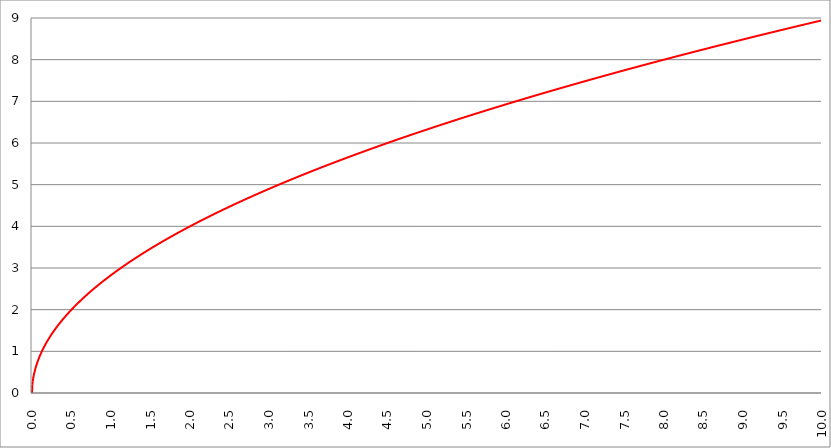
| Category | Series 1 | Series 0 | Series 2 |
|---|---|---|---|
| 0.0 | 0 |  |  |
| 0.005 | 0.2 |  |  |
| 0.01 | 0.283 |  |  |
| 0.015 | 0.346 |  |  |
| 0.02 | 0.4 |  |  |
| 0.025 | 0.447 |  |  |
| 0.03 | 0.49 |  |  |
| 0.035 | 0.529 |  |  |
| 0.04 | 0.566 |  |  |
| 0.045 | 0.6 |  |  |
| 0.05 | 0.632 |  |  |
| 0.055 | 0.663 |  |  |
| 0.06 | 0.693 |  |  |
| 0.065 | 0.721 |  |  |
| 0.07 | 0.748 |  |  |
| 0.075 | 0.775 |  |  |
| 0.08 | 0.8 |  |  |
| 0.085 | 0.825 |  |  |
| 0.09 | 0.849 |  |  |
| 0.095 | 0.872 |  |  |
| 0.1 | 0.894 |  |  |
| 0.105 | 0.917 |  |  |
| 0.11 | 0.938 |  |  |
| 0.115 | 0.959 |  |  |
| 0.12 | 0.98 |  |  |
| 0.125 | 1 |  |  |
| 0.13 | 1.02 |  |  |
| 0.135 | 1.039 |  |  |
| 0.14 | 1.058 |  |  |
| 0.145 | 1.077 |  |  |
| 0.15 | 1.095 |  |  |
| 0.155 | 1.114 |  |  |
| 0.16 | 1.131 |  |  |
| 0.165 | 1.149 |  |  |
| 0.17 | 1.166 |  |  |
| 0.175 | 1.183 |  |  |
| 0.18 | 1.2 |  |  |
| 0.185 | 1.217 |  |  |
| 0.19 | 1.233 |  |  |
| 0.195 | 1.249 |  |  |
| 0.2 | 1.265 |  |  |
| 0.205 | 1.281 |  |  |
| 0.21 | 1.296 |  |  |
| 0.215 | 1.311 |  |  |
| 0.22 | 1.327 |  |  |
| 0.225 | 1.342 |  |  |
| 0.23 | 1.356 |  |  |
| 0.235 | 1.371 |  |  |
| 0.24 | 1.386 |  |  |
| 0.245 | 1.4 |  |  |
| 0.25 | 1.414 |  |  |
| 0.255 | 1.428 |  |  |
| 0.26 | 1.442 |  |  |
| 0.265 | 1.456 |  |  |
| 0.27 | 1.47 |  |  |
| 0.275 | 1.483 |  |  |
| 0.28 | 1.497 |  |  |
| 0.285 | 1.51 |  |  |
| 0.29 | 1.523 |  |  |
| 0.295 | 1.536 |  |  |
| 0.3 | 1.549 |  |  |
| 0.305 | 1.562 |  |  |
| 0.31 | 1.575 |  |  |
| 0.315 | 1.587 |  |  |
| 0.32 | 1.6 |  |  |
| 0.325 | 1.612 |  |  |
| 0.33 | 1.625 |  |  |
| 0.335 | 1.637 |  |  |
| 0.34 | 1.649 |  |  |
| 0.345 | 1.661 |  |  |
| 0.35 | 1.673 |  |  |
| 0.355 | 1.685 |  |  |
| 0.36 | 1.697 |  |  |
| 0.365 | 1.709 |  |  |
| 0.37 | 1.72 |  |  |
| 0.375 | 1.732 |  |  |
| 0.38 | 1.744 |  |  |
| 0.385 | 1.755 |  |  |
| 0.39 | 1.766 |  |  |
| 0.395 | 1.778 |  |  |
| 0.4 | 1.789 |  |  |
| 0.405 | 1.8 |  |  |
| 0.41 | 1.811 |  |  |
| 0.415 | 1.822 |  |  |
| 0.42 | 1.833 |  |  |
| 0.425 | 1.844 |  |  |
| 0.43 | 1.855 |  |  |
| 0.435 | 1.865 |  |  |
| 0.44 | 1.876 |  |  |
| 0.445 | 1.887 |  |  |
| 0.45 | 1.897 |  |  |
| 0.455 | 1.908 |  |  |
| 0.46 | 1.918 |  |  |
| 0.465 | 1.929 |  |  |
| 0.47 | 1.939 |  |  |
| 0.475 | 1.949 |  |  |
| 0.48 | 1.96 |  |  |
| 0.485 | 1.97 |  |  |
| 0.49 | 1.98 |  |  |
| 0.495 | 1.99 |  |  |
| 0.5 | 2 |  |  |
| 0.505 | 2.01 |  |  |
| 0.51 | 2.02 |  |  |
| 0.515 | 2.03 |  |  |
| 0.52 | 2.04 |  |  |
| 0.525 | 2.049 |  |  |
| 0.53 | 2.059 |  |  |
| 0.535 | 2.069 |  |  |
| 0.54 | 2.078 |  |  |
| 0.545 | 2.088 |  |  |
| 0.55 | 2.098 |  |  |
| 0.555 | 2.107 |  |  |
| 0.56 | 2.117 |  |  |
| 0.565 | 2.126 |  |  |
| 0.57 | 2.135 |  |  |
| 0.575 | 2.145 |  |  |
| 0.58 | 2.154 |  |  |
| 0.585 | 2.163 |  |  |
| 0.59 | 2.173 |  |  |
| 0.595 | 2.182 |  |  |
| 0.6 | 2.191 |  |  |
| 0.605 | 2.2 |  |  |
| 0.61 | 2.209 |  |  |
| 0.615 | 2.218 |  |  |
| 0.62 | 2.227 |  |  |
| 0.625 | 2.236 |  |  |
| 0.63 | 2.245 |  |  |
| 0.635 | 2.254 |  |  |
| 0.64 | 2.263 |  |  |
| 0.645 | 2.272 |  |  |
| 0.65 | 2.28 |  |  |
| 0.655 | 2.289 |  |  |
| 0.66 | 2.298 |  |  |
| 0.665 | 2.307 |  |  |
| 0.67 | 2.315 |  |  |
| 0.675 | 2.324 |  |  |
| 0.68 | 2.332 |  |  |
| 0.685 | 2.341 |  |  |
| 0.69 | 2.349 |  |  |
| 0.695 | 2.358 |  |  |
| 0.7 | 2.366 |  |  |
| 0.705 | 2.375 |  |  |
| 0.71 | 2.383 |  |  |
| 0.715 | 2.392 |  |  |
| 0.72 | 2.4 |  |  |
| 0.725 | 2.408 |  |  |
| 0.73 | 2.417 |  |  |
| 0.735 | 2.425 |  |  |
| 0.74 | 2.433 |  |  |
| 0.745 | 2.441 |  |  |
| 0.75 | 2.449 |  |  |
| 0.755 | 2.458 |  |  |
| 0.76 | 2.466 |  |  |
| 0.765 | 2.474 |  |  |
| 0.77 | 2.482 |  |  |
| 0.775000000000001 | 2.49 |  |  |
| 0.78 | 2.498 |  |  |
| 0.785000000000001 | 2.506 |  |  |
| 0.79 | 2.514 |  |  |
| 0.795000000000001 | 2.522 |  |  |
| 0.800000000000001 | 2.53 |  |  |
| 0.805000000000001 | 2.538 |  |  |
| 0.810000000000001 | 2.546 |  |  |
| 0.815000000000001 | 2.553 |  |  |
| 0.820000000000001 | 2.561 |  |  |
| 0.825000000000001 | 2.569 |  |  |
| 0.830000000000001 | 2.577 |  |  |
| 0.835000000000001 | 2.585 |  |  |
| 0.840000000000001 | 2.592 |  |  |
| 0.845000000000001 | 2.6 |  |  |
| 0.850000000000001 | 2.608 |  |  |
| 0.855000000000001 | 2.615 |  |  |
| 0.860000000000001 | 2.623 |  |  |
| 0.865000000000001 | 2.631 |  |  |
| 0.870000000000001 | 2.638 |  |  |
| 0.875000000000001 | 2.646 |  |  |
| 0.880000000000001 | 2.653 |  |  |
| 0.885000000000001 | 2.661 |  |  |
| 0.890000000000001 | 2.668 |  |  |
| 0.895000000000001 | 2.676 |  |  |
| 0.900000000000001 | 2.683 |  |  |
| 0.905000000000001 | 2.691 |  |  |
| 0.910000000000001 | 2.698 |  |  |
| 0.915000000000001 | 2.706 |  |  |
| 0.920000000000001 | 2.713 |  |  |
| 0.925000000000001 | 2.72 |  |  |
| 0.930000000000001 | 2.728 |  |  |
| 0.935000000000001 | 2.735 |  |  |
| 0.940000000000001 | 2.742 |  |  |
| 0.945000000000001 | 2.75 |  |  |
| 0.950000000000001 | 2.757 |  |  |
| 0.955000000000001 | 2.764 |  |  |
| 0.960000000000001 | 2.771 |  |  |
| 0.965000000000001 | 2.778 |  |  |
| 0.970000000000001 | 2.786 |  |  |
| 0.975000000000001 | 2.793 |  |  |
| 0.980000000000001 | 2.8 |  |  |
| 0.985000000000001 | 2.807 |  |  |
| 0.990000000000001 | 2.814 |  |  |
| 0.995000000000001 | 2.821 |  |  |
| 1.000000000000001 | 2.828 |  |  |
| 1.005000000000001 | 2.835 |  |  |
| 1.01 | 2.843 |  |  |
| 1.015 | 2.85 |  |  |
| 1.02 | 2.857 |  |  |
| 1.025 | 2.864 |  |  |
| 1.03 | 2.871 |  |  |
| 1.035 | 2.877 |  |  |
| 1.04 | 2.884 |  |  |
| 1.045 | 2.891 |  |  |
| 1.05 | 2.898 |  |  |
| 1.054999999999999 | 2.905 |  |  |
| 1.059999999999999 | 2.912 |  |  |
| 1.064999999999999 | 2.919 |  |  |
| 1.069999999999999 | 2.926 |  |  |
| 1.074999999999999 | 2.933 |  |  |
| 1.079999999999999 | 2.939 |  |  |
| 1.084999999999999 | 2.946 |  |  |
| 1.089999999999999 | 2.953 |  |  |
| 1.094999999999999 | 2.96 |  |  |
| 1.099999999999999 | 2.966 |  |  |
| 1.104999999999998 | 2.973 |  |  |
| 1.109999999999998 | 2.98 |  |  |
| 1.114999999999998 | 2.987 |  |  |
| 1.119999999999998 | 2.993 |  |  |
| 1.124999999999998 | 3 |  |  |
| 1.129999999999998 | 3.007 |  |  |
| 1.134999999999998 | 3.013 |  |  |
| 1.139999999999998 | 3.02 |  |  |
| 1.144999999999998 | 3.027 |  |  |
| 1.149999999999997 | 3.033 |  |  |
| 1.154999999999997 | 3.04 |  |  |
| 1.159999999999997 | 3.046 |  |  |
| 1.164999999999997 | 3.053 |  |  |
| 1.169999999999997 | 3.059 |  |  |
| 1.174999999999997 | 3.066 |  |  |
| 1.179999999999997 | 3.072 |  |  |
| 1.184999999999997 | 3.079 |  |  |
| 1.189999999999997 | 3.085 |  |  |
| 1.194999999999996 | 3.092 |  |  |
| 1.199999999999996 | 3.098 |  |  |
| 1.204999999999996 | 3.105 |  |  |
| 1.209999999999996 | 3.111 |  |  |
| 1.214999999999996 | 3.118 |  |  |
| 1.219999999999996 | 3.124 |  |  |
| 1.224999999999996 | 3.13 |  |  |
| 1.229999999999996 | 3.137 |  |  |
| 1.234999999999996 | 3.143 |  |  |
| 1.239999999999996 | 3.15 |  |  |
| 1.244999999999995 | 3.156 |  |  |
| 1.249999999999995 | 3.162 |  |  |
| 1.254999999999995 | 3.169 |  |  |
| 1.259999999999995 | 3.175 |  |  |
| 1.264999999999995 | 3.181 |  |  |
| 1.269999999999995 | 3.187 |  |  |
| 1.274999999999995 | 3.194 |  |  |
| 1.279999999999995 | 3.2 |  |  |
| 1.284999999999995 | 3.206 |  |  |
| 1.289999999999994 | 3.212 |  |  |
| 1.294999999999994 | 3.219 |  |  |
| 1.299999999999994 | 3.225 |  |  |
| 1.304999999999994 | 3.231 |  |  |
| 1.309999999999994 | 3.237 |  |  |
| 1.314999999999994 | 3.243 |  |  |
| 1.319999999999994 | 3.25 |  |  |
| 1.324999999999994 | 3.256 |  |  |
| 1.329999999999994 | 3.262 |  |  |
| 1.334999999999993 | 3.268 |  |  |
| 1.339999999999993 | 3.274 |  |  |
| 1.344999999999993 | 3.28 |  |  |
| 1.349999999999993 | 3.286 |  |  |
| 1.354999999999993 | 3.292 |  |  |
| 1.359999999999993 | 3.298 |  |  |
| 1.364999999999993 | 3.305 |  |  |
| 1.369999999999993 | 3.311 |  |  |
| 1.374999999999993 | 3.317 |  |  |
| 1.379999999999993 | 3.323 |  |  |
| 1.384999999999992 | 3.329 |  |  |
| 1.389999999999992 | 3.335 |  |  |
| 1.394999999999992 | 3.341 |  |  |
| 1.399999999999992 | 3.347 |  |  |
| 1.404999999999992 | 3.353 |  |  |
| 1.409999999999992 | 3.359 |  |  |
| 1.414999999999992 | 3.365 |  |  |
| 1.419999999999992 | 3.37 |  |  |
| 1.424999999999992 | 3.376 |  |  |
| 1.429999999999991 | 3.382 |  |  |
| 1.434999999999991 | 3.388 |  |  |
| 1.439999999999991 | 3.394 |  |  |
| 1.444999999999991 | 3.4 |  |  |
| 1.449999999999991 | 3.406 |  |  |
| 1.454999999999991 | 3.412 |  |  |
| 1.459999999999991 | 3.418 |  |  |
| 1.464999999999991 | 3.423 |  |  |
| 1.469999999999991 | 3.429 |  |  |
| 1.474999999999991 | 3.435 |  |  |
| 1.47999999999999 | 3.441 |  |  |
| 1.48499999999999 | 3.447 |  |  |
| 1.48999999999999 | 3.453 |  |  |
| 1.49499999999999 | 3.458 |  |  |
| 1.49999999999999 | 3.464 |  |  |
| 1.50499999999999 | 3.47 |  |  |
| 1.50999999999999 | 3.476 |  |  |
| 1.51499999999999 | 3.481 |  |  |
| 1.51999999999999 | 3.487 |  |  |
| 1.524999999999989 | 3.493 |  |  |
| 1.529999999999989 | 3.499 |  |  |
| 1.534999999999989 | 3.504 |  |  |
| 1.539999999999989 | 3.51 |  |  |
| 1.544999999999989 | 3.516 |  |  |
| 1.549999999999989 | 3.521 |  |  |
| 1.554999999999989 | 3.527 |  |  |
| 1.559999999999989 | 3.533 |  |  |
| 1.564999999999989 | 3.538 |  |  |
| 1.569999999999989 | 3.544 |  |  |
| 1.574999999999988 | 3.55 |  |  |
| 1.579999999999988 | 3.555 |  |  |
| 1.584999999999988 | 3.561 |  |  |
| 1.589999999999988 | 3.567 |  |  |
| 1.594999999999988 | 3.572 |  |  |
| 1.599999999999988 | 3.578 |  |  |
| 1.604999999999988 | 3.583 |  |  |
| 1.609999999999988 | 3.589 |  |  |
| 1.614999999999987 | 3.594 |  |  |
| 1.619999999999987 | 3.6 |  |  |
| 1.624999999999987 | 3.606 |  |  |
| 1.629999999999987 | 3.611 |  |  |
| 1.634999999999987 | 3.617 |  |  |
| 1.639999999999987 | 3.622 |  |  |
| 1.644999999999987 | 3.628 |  |  |
| 1.649999999999987 | 3.633 |  |  |
| 1.654999999999987 | 3.639 |  |  |
| 1.659999999999986 | 3.644 |  |  |
| 1.664999999999986 | 3.65 |  |  |
| 1.669999999999986 | 3.655 |  |  |
| 1.674999999999986 | 3.661 |  |  |
| 1.679999999999986 | 3.666 |  |  |
| 1.684999999999986 | 3.672 |  |  |
| 1.689999999999986 | 3.677 |  |  |
| 1.694999999999986 | 3.682 |  |  |
| 1.699999999999986 | 3.688 |  |  |
| 1.704999999999986 | 3.693 |  |  |
| 1.709999999999985 | 3.699 |  |  |
| 1.714999999999985 | 3.704 |  |  |
| 1.719999999999985 | 3.709 |  |  |
| 1.724999999999985 | 3.715 |  |  |
| 1.729999999999985 | 3.72 |  |  |
| 1.734999999999985 | 3.726 |  |  |
| 1.739999999999985 | 3.731 |  |  |
| 1.744999999999985 | 3.736 |  |  |
| 1.749999999999985 | 3.742 |  |  |
| 1.754999999999984 | 3.747 |  |  |
| 1.759999999999984 | 3.752 |  |  |
| 1.764999999999984 | 3.758 |  |  |
| 1.769999999999984 | 3.763 |  |  |
| 1.774999999999984 | 3.768 |  |  |
| 1.779999999999984 | 3.774 |  |  |
| 1.784999999999984 | 3.779 |  |  |
| 1.789999999999984 | 3.784 |  |  |
| 1.794999999999984 | 3.789 |  |  |
| 1.799999999999984 | 3.795 |  |  |
| 1.804999999999983 | 3.8 |  |  |
| 1.809999999999983 | 3.805 |  |  |
| 1.814999999999983 | 3.811 |  |  |
| 1.819999999999983 | 3.816 |  |  |
| 1.824999999999983 | 3.821 |  |  |
| 1.829999999999983 | 3.826 |  |  |
| 1.834999999999983 | 3.831 |  |  |
| 1.839999999999983 | 3.837 |  |  |
| 1.844999999999983 | 3.842 |  |  |
| 1.849999999999982 | 3.847 |  |  |
| 1.854999999999982 | 3.852 |  |  |
| 1.859999999999982 | 3.857 |  |  |
| 1.864999999999982 | 3.863 |  |  |
| 1.869999999999982 | 3.868 |  |  |
| 1.874999999999982 | 3.873 |  |  |
| 1.879999999999982 | 3.878 |  |  |
| 1.884999999999982 | 3.883 |  |  |
| 1.889999999999982 | 3.888 |  |  |
| 1.894999999999982 | 3.894 |  |  |
| 1.899999999999981 | 3.899 |  |  |
| 1.904999999999981 | 3.904 |  |  |
| 1.909999999999981 | 3.909 |  |  |
| 1.914999999999981 | 3.914 |  |  |
| 1.919999999999981 | 3.919 |  |  |
| 1.924999999999981 | 3.924 |  |  |
| 1.929999999999981 | 3.929 |  |  |
| 1.934999999999981 | 3.934 |  |  |
| 1.939999999999981 | 3.94 |  |  |
| 1.94499999999998 | 3.945 |  |  |
| 1.94999999999998 | 3.95 |  |  |
| 1.95499999999998 | 3.955 |  |  |
| 1.95999999999998 | 3.96 |  |  |
| 1.96499999999998 | 3.965 |  |  |
| 1.96999999999998 | 3.97 |  |  |
| 1.97499999999998 | 3.975 |  |  |
| 1.97999999999998 | 3.98 |  |  |
| 1.98499999999998 | 3.985 |  |  |
| 1.98999999999998 | 3.99 |  |  |
| 1.994999999999979 | 3.995 |  |  |
| 1.999999999999979 | 4 |  |  |
| 2.004999999999979 | 4.005 |  |  |
| 2.009999999999979 | 4.01 |  |  |
| 2.014999999999979 | 4.015 |  |  |
| 2.019999999999979 | 4.02 |  |  |
| 2.02499999999998 | 4.025 |  |  |
| 2.029999999999979 | 4.03 |  |  |
| 2.034999999999979 | 4.035 |  |  |
| 2.039999999999979 | 4.04 |  |  |
| 2.044999999999979 | 4.045 |  |  |
| 2.049999999999978 | 4.05 |  |  |
| 2.054999999999978 | 4.055 |  |  |
| 2.059999999999978 | 4.06 |  |  |
| 2.064999999999978 | 4.064 |  |  |
| 2.069999999999978 | 4.069 |  |  |
| 2.074999999999978 | 4.074 |  |  |
| 2.079999999999978 | 4.079 |  |  |
| 2.084999999999978 | 4.084 |  |  |
| 2.089999999999978 | 4.089 |  |  |
| 2.094999999999978 | 4.094 |  |  |
| 2.099999999999977 | 4.099 |  |  |
| 2.104999999999977 | 4.104 |  |  |
| 2.109999999999977 | 4.109 |  |  |
| 2.114999999999977 | 4.113 |  |  |
| 2.119999999999977 | 4.118 |  |  |
| 2.124999999999977 | 4.123 |  |  |
| 2.129999999999977 | 4.128 |  |  |
| 2.134999999999977 | 4.133 |  |  |
| 2.139999999999977 | 4.138 |  |  |
| 2.144999999999976 | 4.142 |  |  |
| 2.149999999999976 | 4.147 |  |  |
| 2.154999999999976 | 4.152 |  |  |
| 2.159999999999976 | 4.157 |  |  |
| 2.164999999999976 | 4.162 |  |  |
| 2.169999999999976 | 4.167 |  |  |
| 2.174999999999976 | 4.171 |  |  |
| 2.179999999999976 | 4.176 |  |  |
| 2.184999999999976 | 4.181 |  |  |
| 2.189999999999975 | 4.186 |  |  |
| 2.194999999999975 | 4.19 |  |  |
| 2.199999999999975 | 4.195 |  |  |
| 2.204999999999975 | 4.2 |  |  |
| 2.209999999999975 | 4.205 |  |  |
| 2.214999999999975 | 4.21 |  |  |
| 2.219999999999975 | 4.214 |  |  |
| 2.224999999999975 | 4.219 |  |  |
| 2.229999999999975 | 4.224 |  |  |
| 2.234999999999975 | 4.228 |  |  |
| 2.239999999999974 | 4.233 |  |  |
| 2.244999999999974 | 4.238 |  |  |
| 2.249999999999974 | 4.243 |  |  |
| 2.254999999999974 | 4.247 |  |  |
| 2.259999999999974 | 4.252 |  |  |
| 2.264999999999974 | 4.257 |  |  |
| 2.269999999999974 | 4.261 |  |  |
| 2.274999999999974 | 4.266 |  |  |
| 2.279999999999974 | 4.271 |  |  |
| 2.284999999999973 | 4.276 |  |  |
| 2.289999999999973 | 4.28 |  |  |
| 2.294999999999973 | 4.285 |  |  |
| 2.299999999999973 | 4.29 |  |  |
| 2.304999999999973 | 4.294 |  |  |
| 2.309999999999973 | 4.299 |  |  |
| 2.314999999999973 | 4.303 |  |  |
| 2.319999999999973 | 4.308 |  |  |
| 2.324999999999973 | 4.313 |  |  |
| 2.329999999999972 | 4.317 |  |  |
| 2.334999999999972 | 4.322 |  |  |
| 2.339999999999972 | 4.327 |  |  |
| 2.344999999999972 | 4.331 |  |  |
| 2.349999999999972 | 4.336 |  |  |
| 2.354999999999972 | 4.341 |  |  |
| 2.359999999999972 | 4.345 |  |  |
| 2.364999999999972 | 4.35 |  |  |
| 2.369999999999972 | 4.354 |  |  |
| 2.374999999999972 | 4.359 |  |  |
| 2.379999999999971 | 4.363 |  |  |
| 2.384999999999971 | 4.368 |  |  |
| 2.389999999999971 | 4.373 |  |  |
| 2.394999999999971 | 4.377 |  |  |
| 2.399999999999971 | 4.382 |  |  |
| 2.404999999999971 | 4.386 |  |  |
| 2.409999999999971 | 4.391 |  |  |
| 2.414999999999971 | 4.395 |  |  |
| 2.419999999999971 | 4.4 |  |  |
| 2.42499999999997 | 4.405 |  |  |
| 2.42999999999997 | 4.409 |  |  |
| 2.43499999999997 | 4.414 |  |  |
| 2.43999999999997 | 4.418 |  |  |
| 2.44499999999997 | 4.423 |  |  |
| 2.44999999999997 | 4.427 |  |  |
| 2.45499999999997 | 4.432 |  |  |
| 2.45999999999997 | 4.436 |  |  |
| 2.46499999999997 | 4.441 |  |  |
| 2.46999999999997 | 4.445 |  |  |
| 2.474999999999969 | 4.45 |  |  |
| 2.479999999999969 | 4.454 |  |  |
| 2.484999999999969 | 4.459 |  |  |
| 2.489999999999969 | 4.463 |  |  |
| 2.494999999999969 | 4.468 |  |  |
| 2.499999999999969 | 4.472 |  |  |
| 2.504999999999969 | 4.477 |  |  |
| 2.509999999999969 | 4.481 |  |  |
| 2.514999999999969 | 4.486 |  |  |
| 2.519999999999968 | 4.49 |  |  |
| 2.524999999999968 | 4.494 |  |  |
| 2.529999999999968 | 4.499 |  |  |
| 2.534999999999968 | 4.503 |  |  |
| 2.539999999999968 | 4.508 |  |  |
| 2.544999999999968 | 4.512 |  |  |
| 2.549999999999968 | 4.517 |  |  |
| 2.554999999999968 | 4.521 |  |  |
| 2.559999999999968 | 4.525 |  |  |
| 2.564999999999968 | 4.53 |  |  |
| 2.569999999999967 | 4.534 |  |  |
| 2.574999999999967 | 4.539 |  |  |
| 2.579999999999967 | 4.543 |  |  |
| 2.584999999999967 | 4.548 |  |  |
| 2.589999999999967 | 4.552 |  |  |
| 2.594999999999967 | 4.556 |  |  |
| 2.599999999999967 | 4.561 |  |  |
| 2.604999999999967 | 4.565 |  |  |
| 2.609999999999966 | 4.569 |  |  |
| 2.614999999999966 | 4.574 |  |  |
| 2.619999999999966 | 4.578 |  |  |
| 2.624999999999966 | 4.583 |  |  |
| 2.629999999999966 | 4.587 |  |  |
| 2.634999999999966 | 4.591 |  |  |
| 2.639999999999966 | 4.596 |  |  |
| 2.644999999999966 | 4.6 |  |  |
| 2.649999999999966 | 4.604 |  |  |
| 2.654999999999966 | 4.609 |  |  |
| 2.659999999999965 | 4.613 |  |  |
| 2.664999999999965 | 4.617 |  |  |
| 2.669999999999965 | 4.622 |  |  |
| 2.674999999999965 | 4.626 |  |  |
| 2.679999999999965 | 4.63 |  |  |
| 2.684999999999965 | 4.635 |  |  |
| 2.689999999999965 | 4.639 |  |  |
| 2.694999999999965 | 4.643 |  |  |
| 2.699999999999965 | 4.648 |  |  |
| 2.704999999999964 | 4.652 |  |  |
| 2.709999999999964 | 4.656 |  |  |
| 2.714999999999964 | 4.66 |  |  |
| 2.719999999999964 | 4.665 |  |  |
| 2.724999999999964 | 4.669 |  |  |
| 2.729999999999964 | 4.673 |  |  |
| 2.734999999999964 | 4.678 |  |  |
| 2.739999999999964 | 4.682 |  |  |
| 2.744999999999964 | 4.686 |  |  |
| 2.749999999999964 | 4.69 |  |  |
| 2.754999999999963 | 4.695 |  |  |
| 2.759999999999963 | 4.699 |  |  |
| 2.764999999999963 | 4.703 |  |  |
| 2.769999999999963 | 4.707 |  |  |
| 2.774999999999963 | 4.712 |  |  |
| 2.779999999999963 | 4.716 |  |  |
| 2.784999999999963 | 4.72 |  |  |
| 2.789999999999963 | 4.724 |  |  |
| 2.794999999999963 | 4.729 |  |  |
| 2.799999999999962 | 4.733 |  |  |
| 2.804999999999962 | 4.737 |  |  |
| 2.809999999999962 | 4.741 |  |  |
| 2.814999999999962 | 4.746 |  |  |
| 2.819999999999962 | 4.75 |  |  |
| 2.824999999999962 | 4.754 |  |  |
| 2.829999999999962 | 4.758 |  |  |
| 2.834999999999962 | 4.762 |  |  |
| 2.839999999999962 | 4.767 |  |  |
| 2.844999999999962 | 4.771 |  |  |
| 2.849999999999961 | 4.775 |  |  |
| 2.854999999999961 | 4.779 |  |  |
| 2.859999999999961 | 4.783 |  |  |
| 2.864999999999961 | 4.787 |  |  |
| 2.869999999999961 | 4.792 |  |  |
| 2.874999999999961 | 4.796 |  |  |
| 2.879999999999961 | 4.8 |  |  |
| 2.884999999999961 | 4.804 |  |  |
| 2.889999999999961 | 4.808 |  |  |
| 2.89499999999996 | 4.812 |  |  |
| 2.89999999999996 | 4.817 |  |  |
| 2.90499999999996 | 4.821 |  |  |
| 2.90999999999996 | 4.825 |  |  |
| 2.91499999999996 | 4.829 |  |  |
| 2.91999999999996 | 4.833 |  |  |
| 2.92499999999996 | 4.837 |  |  |
| 2.92999999999996 | 4.841 |  |  |
| 2.93499999999996 | 4.846 |  |  |
| 2.93999999999996 | 4.85 |  |  |
| 2.944999999999959 | 4.854 |  |  |
| 2.949999999999959 | 4.858 |  |  |
| 2.954999999999959 | 4.862 |  |  |
| 2.959999999999959 | 4.866 |  |  |
| 2.964999999999959 | 4.87 |  |  |
| 2.969999999999959 | 4.874 |  |  |
| 2.974999999999959 | 4.879 |  |  |
| 2.979999999999959 | 4.883 |  |  |
| 2.984999999999959 | 4.887 |  |  |
| 2.989999999999958 | 4.891 |  |  |
| 2.994999999999958 | 4.895 |  |  |
| 2.999999999999958 | 4.899 |  |  |
| 3.004999999999958 | 4.903 |  |  |
| 3.009999999999958 | 4.907 |  |  |
| 3.014999999999958 | 4.911 |  |  |
| 3.019999999999958 | 4.915 |  |  |
| 3.024999999999958 | 4.919 |  |  |
| 3.029999999999958 | 4.923 |  |  |
| 3.034999999999958 | 4.927 |  |  |
| 3.039999999999957 | 4.932 |  |  |
| 3.044999999999957 | 4.936 |  |  |
| 3.049999999999957 | 4.94 |  |  |
| 3.054999999999957 | 4.944 |  |  |
| 3.059999999999957 | 4.948 |  |  |
| 3.064999999999957 | 4.952 |  |  |
| 3.069999999999957 | 4.956 |  |  |
| 3.074999999999957 | 4.96 |  |  |
| 3.079999999999957 | 4.964 |  |  |
| 3.084999999999956 | 4.968 |  |  |
| 3.089999999999956 | 4.972 |  |  |
| 3.094999999999956 | 4.976 |  |  |
| 3.099999999999956 | 4.98 |  |  |
| 3.104999999999956 | 4.984 |  |  |
| 3.109999999999956 | 4.988 |  |  |
| 3.114999999999956 | 4.992 |  |  |
| 3.119999999999956 | 4.996 |  |  |
| 3.124999999999956 | 5 |  |  |
| 3.129999999999955 | 5.004 |  |  |
| 3.134999999999955 | 5.008 |  |  |
| 3.139999999999955 | 5.012 |  |  |
| 3.144999999999955 | 5.016 |  |  |
| 3.149999999999955 | 5.02 |  |  |
| 3.154999999999955 | 5.024 |  |  |
| 3.159999999999955 | 5.028 |  |  |
| 3.164999999999955 | 5.032 |  |  |
| 3.169999999999955 | 5.036 |  |  |
| 3.174999999999955 | 5.04 |  |  |
| 3.179999999999954 | 5.044 |  |  |
| 3.184999999999954 | 5.048 |  |  |
| 3.189999999999954 | 5.052 |  |  |
| 3.194999999999954 | 5.056 |  |  |
| 3.199999999999954 | 5.06 |  |  |
| 3.204999999999954 | 5.064 |  |  |
| 3.209999999999954 | 5.068 |  |  |
| 3.214999999999954 | 5.071 |  |  |
| 3.219999999999954 | 5.075 |  |  |
| 3.224999999999953 | 5.079 |  |  |
| 3.229999999999953 | 5.083 |  |  |
| 3.234999999999953 | 5.087 |  |  |
| 3.239999999999953 | 5.091 |  |  |
| 3.244999999999953 | 5.095 |  |  |
| 3.249999999999953 | 5.099 |  |  |
| 3.254999999999953 | 5.103 |  |  |
| 3.259999999999953 | 5.107 |  |  |
| 3.264999999999952 | 5.111 |  |  |
| 3.269999999999952 | 5.115 |  |  |
| 3.274999999999952 | 5.119 |  |  |
| 3.279999999999952 | 5.122 |  |  |
| 3.284999999999952 | 5.126 |  |  |
| 3.289999999999952 | 5.13 |  |  |
| 3.294999999999952 | 5.134 |  |  |
| 3.299999999999952 | 5.138 |  |  |
| 3.304999999999952 | 5.142 |  |  |
| 3.309999999999952 | 5.146 |  |  |
| 3.314999999999951 | 5.15 |  |  |
| 3.319999999999951 | 5.154 |  |  |
| 3.324999999999951 | 5.158 |  |  |
| 3.329999999999951 | 5.161 |  |  |
| 3.334999999999951 | 5.165 |  |  |
| 3.339999999999951 | 5.169 |  |  |
| 3.344999999999951 | 5.173 |  |  |
| 3.349999999999951 | 5.177 |  |  |
| 3.354999999999951 | 5.181 |  |  |
| 3.359999999999951 | 5.185 |  |  |
| 3.36499999999995 | 5.188 |  |  |
| 3.36999999999995 | 5.192 |  |  |
| 3.37499999999995 | 5.196 |  |  |
| 3.37999999999995 | 5.2 |  |  |
| 3.38499999999995 | 5.204 |  |  |
| 3.38999999999995 | 5.208 |  |  |
| 3.39499999999995 | 5.212 |  |  |
| 3.39999999999995 | 5.215 |  |  |
| 3.40499999999995 | 5.219 |  |  |
| 3.409999999999949 | 5.223 |  |  |
| 3.414999999999949 | 5.227 |  |  |
| 3.419999999999949 | 5.231 |  |  |
| 3.424999999999949 | 5.235 |  |  |
| 3.429999999999949 | 5.238 |  |  |
| 3.434999999999949 | 5.242 |  |  |
| 3.439999999999949 | 5.246 |  |  |
| 3.444999999999949 | 5.25 |  |  |
| 3.449999999999949 | 5.254 |  |  |
| 3.454999999999949 | 5.257 |  |  |
| 3.459999999999948 | 5.261 |  |  |
| 3.464999999999948 | 5.265 |  |  |
| 3.469999999999948 | 5.269 |  |  |
| 3.474999999999948 | 5.273 |  |  |
| 3.479999999999948 | 5.276 |  |  |
| 3.484999999999948 | 5.28 |  |  |
| 3.489999999999948 | 5.284 |  |  |
| 3.494999999999948 | 5.288 |  |  |
| 3.499999999999948 | 5.292 |  |  |
| 3.504999999999947 | 5.295 |  |  |
| 3.509999999999947 | 5.299 |  |  |
| 3.514999999999947 | 5.303 |  |  |
| 3.519999999999947 | 5.307 |  |  |
| 3.524999999999947 | 5.31 |  |  |
| 3.529999999999947 | 5.314 |  |  |
| 3.534999999999947 | 5.318 |  |  |
| 3.539999999999947 | 5.322 |  |  |
| 3.544999999999947 | 5.325 |  |  |
| 3.549999999999947 | 5.329 |  |  |
| 3.554999999999946 | 5.333 |  |  |
| 3.559999999999946 | 5.337 |  |  |
| 3.564999999999946 | 5.34 |  |  |
| 3.569999999999946 | 5.344 |  |  |
| 3.574999999999946 | 5.348 |  |  |
| 3.579999999999946 | 5.352 |  |  |
| 3.584999999999946 | 5.355 |  |  |
| 3.589999999999946 | 5.359 |  |  |
| 3.594999999999946 | 5.363 |  |  |
| 3.599999999999945 | 5.367 |  |  |
| 3.604999999999945 | 5.37 |  |  |
| 3.609999999999945 | 5.374 |  |  |
| 3.614999999999945 | 5.378 |  |  |
| 3.619999999999945 | 5.381 |  |  |
| 3.624999999999945 | 5.385 |  |  |
| 3.629999999999945 | 5.389 |  |  |
| 3.634999999999945 | 5.393 |  |  |
| 3.639999999999945 | 5.396 |  |  |
| 3.644999999999944 | 5.4 |  |  |
| 3.649999999999944 | 5.404 |  |  |
| 3.654999999999944 | 5.407 |  |  |
| 3.659999999999944 | 5.411 |  |  |
| 3.664999999999944 | 5.415 |  |  |
| 3.669999999999944 | 5.418 |  |  |
| 3.674999999999944 | 5.422 |  |  |
| 3.679999999999944 | 5.426 |  |  |
| 3.684999999999944 | 5.43 |  |  |
| 3.689999999999943 | 5.433 |  |  |
| 3.694999999999943 | 5.437 |  |  |
| 3.699999999999943 | 5.441 |  |  |
| 3.704999999999943 | 5.444 |  |  |
| 3.709999999999943 | 5.448 |  |  |
| 3.714999999999943 | 5.452 |  |  |
| 3.719999999999943 | 5.455 |  |  |
| 3.724999999999943 | 5.459 |  |  |
| 3.729999999999943 | 5.463 |  |  |
| 3.734999999999943 | 5.466 |  |  |
| 3.739999999999942 | 5.47 |  |  |
| 3.744999999999942 | 5.474 |  |  |
| 3.749999999999942 | 5.477 |  |  |
| 3.754999999999942 | 5.481 |  |  |
| 3.759999999999942 | 5.485 |  |  |
| 3.764999999999942 | 5.488 |  |  |
| 3.769999999999942 | 5.492 |  |  |
| 3.774999999999942 | 5.495 |  |  |
| 3.779999999999942 | 5.499 |  |  |
| 3.784999999999941 | 5.503 |  |  |
| 3.789999999999941 | 5.506 |  |  |
| 3.794999999999941 | 5.51 |  |  |
| 3.799999999999941 | 5.514 |  |  |
| 3.804999999999941 | 5.517 |  |  |
| 3.809999999999941 | 5.521 |  |  |
| 3.814999999999941 | 5.524 |  |  |
| 3.819999999999941 | 5.528 |  |  |
| 3.824999999999941 | 5.532 |  |  |
| 3.829999999999941 | 5.535 |  |  |
| 3.83499999999994 | 5.539 |  |  |
| 3.83999999999994 | 5.543 |  |  |
| 3.84499999999994 | 5.546 |  |  |
| 3.84999999999994 | 5.55 |  |  |
| 3.85499999999994 | 5.553 |  |  |
| 3.85999999999994 | 5.557 |  |  |
| 3.86499999999994 | 5.561 |  |  |
| 3.86999999999994 | 5.564 |  |  |
| 3.87499999999994 | 5.568 |  |  |
| 3.879999999999939 | 5.571 |  |  |
| 3.884999999999939 | 5.575 |  |  |
| 3.889999999999939 | 5.579 |  |  |
| 3.894999999999939 | 5.582 |  |  |
| 3.899999999999939 | 5.586 |  |  |
| 3.904999999999939 | 5.589 |  |  |
| 3.909999999999939 | 5.593 |  |  |
| 3.914999999999939 | 5.596 |  |  |
| 3.919999999999939 | 5.6 |  |  |
| 3.924999999999939 | 5.604 |  |  |
| 3.929999999999938 | 5.607 |  |  |
| 3.934999999999938 | 5.611 |  |  |
| 3.939999999999938 | 5.614 |  |  |
| 3.944999999999938 | 5.618 |  |  |
| 3.949999999999938 | 5.621 |  |  |
| 3.954999999999938 | 5.625 |  |  |
| 3.959999999999938 | 5.628 |  |  |
| 3.964999999999938 | 5.632 |  |  |
| 3.969999999999938 | 5.636 |  |  |
| 3.974999999999937 | 5.639 |  |  |
| 3.979999999999937 | 5.643 |  |  |
| 3.984999999999937 | 5.646 |  |  |
| 3.989999999999937 | 5.65 |  |  |
| 3.994999999999937 | 5.653 |  |  |
| 3.999999999999937 | 5.657 |  |  |
| 4.004999999999937 | 5.66 |  |  |
| 4.009999999999936 | 5.664 |  |  |
| 4.014999999999937 | 5.667 |  |  |
| 4.019999999999936 | 5.671 |  |  |
| 4.024999999999936 | 5.675 |  |  |
| 4.029999999999936 | 5.678 |  |  |
| 4.034999999999936 | 5.682 |  |  |
| 4.039999999999936 | 5.685 |  |  |
| 4.044999999999936 | 5.689 |  |  |
| 4.049999999999935 | 5.692 |  |  |
| 4.054999999999936 | 5.696 |  |  |
| 4.059999999999935 | 5.699 |  |  |
| 4.064999999999936 | 5.703 |  |  |
| 4.069999999999935 | 5.706 |  |  |
| 4.074999999999935 | 5.71 |  |  |
| 4.079999999999935 | 5.713 |  |  |
| 4.084999999999935 | 5.717 |  |  |
| 4.089999999999935 | 5.72 |  |  |
| 4.094999999999935 | 5.724 |  |  |
| 4.099999999999934 | 5.727 |  |  |
| 4.104999999999935 | 5.731 |  |  |
| 4.109999999999934 | 5.734 |  |  |
| 4.114999999999934 | 5.738 |  |  |
| 4.119999999999934 | 5.741 |  |  |
| 4.124999999999934 | 5.745 |  |  |
| 4.129999999999934 | 5.748 |  |  |
| 4.134999999999934 | 5.752 |  |  |
| 4.139999999999934 | 5.755 |  |  |
| 4.144999999999934 | 5.758 |  |  |
| 4.149999999999934 | 5.762 |  |  |
| 4.154999999999934 | 5.765 |  |  |
| 4.159999999999934 | 5.769 |  |  |
| 4.164999999999933 | 5.772 |  |  |
| 4.169999999999933 | 5.776 |  |  |
| 4.174999999999933 | 5.779 |  |  |
| 4.179999999999933 | 5.783 |  |  |
| 4.184999999999933 | 5.786 |  |  |
| 4.189999999999933 | 5.79 |  |  |
| 4.194999999999933 | 5.793 |  |  |
| 4.199999999999933 | 5.797 |  |  |
| 4.204999999999933 | 5.8 |  |  |
| 4.209999999999932 | 5.803 |  |  |
| 4.214999999999932 | 5.807 |  |  |
| 4.219999999999932 | 5.81 |  |  |
| 4.224999999999932 | 5.814 |  |  |
| 4.229999999999932 | 5.817 |  |  |
| 4.234999999999932 | 5.821 |  |  |
| 4.239999999999931 | 5.824 |  |  |
| 4.244999999999932 | 5.828 |  |  |
| 4.249999999999931 | 5.831 |  |  |
| 4.254999999999931 | 5.834 |  |  |
| 4.259999999999931 | 5.838 |  |  |
| 4.264999999999931 | 5.841 |  |  |
| 4.269999999999931 | 5.845 |  |  |
| 4.274999999999931 | 5.848 |  |  |
| 4.27999999999993 | 5.851 |  |  |
| 4.284999999999931 | 5.855 |  |  |
| 4.28999999999993 | 5.858 |  |  |
| 4.294999999999931 | 5.862 |  |  |
| 4.29999999999993 | 5.865 |  |  |
| 4.30499999999993 | 5.869 |  |  |
| 4.30999999999993 | 5.872 |  |  |
| 4.31499999999993 | 5.875 |  |  |
| 4.31999999999993 | 5.879 |  |  |
| 4.32499999999993 | 5.882 |  |  |
| 4.32999999999993 | 5.886 |  |  |
| 4.33499999999993 | 5.889 |  |  |
| 4.33999999999993 | 5.892 |  |  |
| 4.34499999999993 | 5.896 |  |  |
| 4.34999999999993 | 5.899 |  |  |
| 4.354999999999929 | 5.903 |  |  |
| 4.35999999999993 | 5.906 |  |  |
| 4.364999999999929 | 5.909 |  |  |
| 4.369999999999929 | 5.913 |  |  |
| 4.374999999999929 | 5.916 |  |  |
| 4.379999999999928 | 5.919 |  |  |
| 4.384999999999929 | 5.923 |  |  |
| 4.389999999999928 | 5.926 |  |  |
| 4.394999999999928 | 5.93 |  |  |
| 4.399999999999928 | 5.933 |  |  |
| 4.404999999999928 | 5.936 |  |  |
| 4.409999999999928 | 5.94 |  |  |
| 4.414999999999928 | 5.943 |  |  |
| 4.419999999999927 | 5.946 |  |  |
| 4.424999999999928 | 5.95 |  |  |
| 4.429999999999927 | 5.953 |  |  |
| 4.434999999999927 | 5.957 |  |  |
| 4.439999999999927 | 5.96 |  |  |
| 4.444999999999927 | 5.963 |  |  |
| 4.449999999999927 | 5.967 |  |  |
| 4.454999999999927 | 5.97 |  |  |
| 4.459999999999927 | 5.973 |  |  |
| 4.464999999999927 | 5.977 |  |  |
| 4.469999999999926 | 5.98 |  |  |
| 4.474999999999926 | 5.983 |  |  |
| 4.479999999999926 | 5.987 |  |  |
| 4.484999999999926 | 5.99 |  |  |
| 4.489999999999926 | 5.993 |  |  |
| 4.494999999999926 | 5.997 |  |  |
| 4.499999999999926 | 6 |  |  |
| 4.504999999999926 | 6.003 |  |  |
| 4.509999999999926 | 6.007 |  |  |
| 4.514999999999926 | 6.01 |  |  |
| 4.519999999999925 | 6.013 |  |  |
| 4.524999999999926 | 6.017 |  |  |
| 4.529999999999925 | 6.02 |  |  |
| 4.534999999999925 | 6.023 |  |  |
| 4.539999999999925 | 6.027 |  |  |
| 4.544999999999925 | 6.03 |  |  |
| 4.549999999999925 | 6.033 |  |  |
| 4.554999999999925 | 6.037 |  |  |
| 4.559999999999924 | 6.04 |  |  |
| 4.564999999999925 | 6.043 |  |  |
| 4.569999999999924 | 6.046 |  |  |
| 4.574999999999924 | 6.05 |  |  |
| 4.579999999999924 | 6.053 |  |  |
| 4.584999999999924 | 6.056 |  |  |
| 4.589999999999924 | 6.06 |  |  |
| 4.594999999999924 | 6.063 |  |  |
| 4.599999999999924 | 6.066 |  |  |
| 4.604999999999924 | 6.07 |  |  |
| 4.609999999999924 | 6.073 |  |  |
| 4.614999999999924 | 6.076 |  |  |
| 4.619999999999924 | 6.079 |  |  |
| 4.624999999999924 | 6.083 |  |  |
| 4.629999999999923 | 6.086 |  |  |
| 4.634999999999923 | 6.089 |  |  |
| 4.639999999999923 | 6.093 |  |  |
| 4.644999999999923 | 6.096 |  |  |
| 4.649999999999923 | 6.099 |  |  |
| 4.654999999999923 | 6.102 |  |  |
| 4.659999999999923 | 6.106 |  |  |
| 4.664999999999923 | 6.109 |  |  |
| 4.669999999999923 | 6.112 |  |  |
| 4.674999999999922 | 6.116 |  |  |
| 4.679999999999922 | 6.119 |  |  |
| 4.684999999999922 | 6.122 |  |  |
| 4.689999999999922 | 6.125 |  |  |
| 4.694999999999922 | 6.129 |  |  |
| 4.699999999999922 | 6.132 |  |  |
| 4.704999999999922 | 6.135 |  |  |
| 4.709999999999921 | 6.138 |  |  |
| 4.714999999999922 | 6.142 |  |  |
| 4.719999999999921 | 6.145 |  |  |
| 4.724999999999921 | 6.148 |  |  |
| 4.729999999999921 | 6.151 |  |  |
| 4.734999999999921 | 6.155 |  |  |
| 4.73999999999992 | 6.158 |  |  |
| 4.744999999999921 | 6.161 |  |  |
| 4.74999999999992 | 6.164 |  |  |
| 4.754999999999921 | 6.168 |  |  |
| 4.75999999999992 | 6.171 |  |  |
| 4.764999999999921 | 6.174 |  |  |
| 4.76999999999992 | 6.177 |  |  |
| 4.77499999999992 | 6.181 |  |  |
| 4.77999999999992 | 6.184 |  |  |
| 4.78499999999992 | 6.187 |  |  |
| 4.78999999999992 | 6.19 |  |  |
| 4.79499999999992 | 6.194 |  |  |
| 4.79999999999992 | 6.197 |  |  |
| 4.80499999999992 | 6.2 |  |  |
| 4.80999999999992 | 6.203 |  |  |
| 4.81499999999992 | 6.206 |  |  |
| 4.819999999999919 | 6.21 |  |  |
| 4.824999999999919 | 6.213 |  |  |
| 4.829999999999919 | 6.216 |  |  |
| 4.834999999999919 | 6.219 |  |  |
| 4.839999999999919 | 6.223 |  |  |
| 4.844999999999919 | 6.226 |  |  |
| 4.849999999999919 | 6.229 |  |  |
| 4.854999999999919 | 6.232 |  |  |
| 4.859999999999919 | 6.235 |  |  |
| 4.864999999999918 | 6.239 |  |  |
| 4.869999999999918 | 6.242 |  |  |
| 4.874999999999918 | 6.245 |  |  |
| 4.879999999999918 | 6.248 |  |  |
| 4.884999999999918 | 6.251 |  |  |
| 4.889999999999918 | 6.255 |  |  |
| 4.894999999999918 | 6.258 |  |  |
| 4.899999999999918 | 6.261 |  |  |
| 4.904999999999918 | 6.264 |  |  |
| 4.909999999999917 | 6.267 |  |  |
| 4.914999999999917 | 6.271 |  |  |
| 4.919999999999917 | 6.274 |  |  |
| 4.924999999999917 | 6.277 |  |  |
| 4.929999999999917 | 6.28 |  |  |
| 4.934999999999917 | 6.283 |  |  |
| 4.939999999999916 | 6.286 |  |  |
| 4.944999999999917 | 6.29 |  |  |
| 4.949999999999916 | 6.293 |  |  |
| 4.954999999999917 | 6.296 |  |  |
| 4.959999999999916 | 6.299 |  |  |
| 4.964999999999916 | 6.302 |  |  |
| 4.969999999999916 | 6.306 |  |  |
| 4.974999999999916 | 6.309 |  |  |
| 4.979999999999916 | 6.312 |  |  |
| 4.984999999999916 | 6.315 |  |  |
| 4.989999999999915 | 6.318 |  |  |
| 4.994999999999916 | 6.321 |  |  |
| 4.999999999999915 | 6.325 |  |  |
| 5.004999999999916 | 6.328 |  |  |
| 5.009999999999915 | 6.331 |  |  |
| 5.014999999999915 | 6.334 |  |  |
| 5.019999999999915 | 6.337 |  |  |
| 5.024999999999915 | 6.34 |  |  |
| 5.029999999999915 | 6.344 |  |  |
| 5.034999999999915 | 6.347 |  |  |
| 5.039999999999914 | 6.35 |  |  |
| 5.044999999999915 | 6.353 |  |  |
| 5.049999999999914 | 6.356 |  |  |
| 5.054999999999914 | 6.359 |  |  |
| 5.059999999999914 | 6.362 |  |  |
| 5.064999999999914 | 6.366 |  |  |
| 5.069999999999914 | 6.369 |  |  |
| 5.074999999999914 | 6.372 |  |  |
| 5.079999999999914 | 6.375 |  |  |
| 5.084999999999914 | 6.378 |  |  |
| 5.089999999999914 | 6.381 |  |  |
| 5.094999999999914 | 6.384 |  |  |
| 5.099999999999913 | 6.387 |  |  |
| 5.104999999999913 | 6.391 |  |  |
| 5.109999999999913 | 6.394 |  |  |
| 5.114999999999913 | 6.397 |  |  |
| 5.119999999999913 | 6.4 |  |  |
| 5.124999999999913 | 6.403 |  |  |
| 5.129999999999913 | 6.406 |  |  |
| 5.134999999999913 | 6.409 |  |  |
| 5.139999999999913 | 6.412 |  |  |
| 5.144999999999913 | 6.416 |  |  |
| 5.149999999999912 | 6.419 |  |  |
| 5.154999999999912 | 6.422 |  |  |
| 5.159999999999912 | 6.425 |  |  |
| 5.164999999999912 | 6.428 |  |  |
| 5.169999999999912 | 6.431 |  |  |
| 5.174999999999912 | 6.434 |  |  |
| 5.179999999999912 | 6.437 |  |  |
| 5.184999999999912 | 6.44 |  |  |
| 5.189999999999912 | 6.444 |  |  |
| 5.194999999999911 | 6.447 |  |  |
| 5.199999999999911 | 6.45 |  |  |
| 5.204999999999911 | 6.453 |  |  |
| 5.209999999999911 | 6.456 |  |  |
| 5.214999999999911 | 6.459 |  |  |
| 5.219999999999911 | 6.462 |  |  |
| 5.224999999999911 | 6.465 |  |  |
| 5.229999999999911 | 6.468 |  |  |
| 5.234999999999911 | 6.471 |  |  |
| 5.23999999999991 | 6.475 |  |  |
| 5.24499999999991 | 6.478 |  |  |
| 5.24999999999991 | 6.481 |  |  |
| 5.25499999999991 | 6.484 |  |  |
| 5.25999999999991 | 6.487 |  |  |
| 5.26499999999991 | 6.49 |  |  |
| 5.26999999999991 | 6.493 |  |  |
| 5.27499999999991 | 6.496 |  |  |
| 5.27999999999991 | 6.499 |  |  |
| 5.28499999999991 | 6.502 |  |  |
| 5.28999999999991 | 6.505 |  |  |
| 5.294999999999909 | 6.508 |  |  |
| 5.29999999999991 | 6.512 |  |  |
| 5.304999999999909 | 6.515 |  |  |
| 5.309999999999909 | 6.518 |  |  |
| 5.314999999999909 | 6.521 |  |  |
| 5.319999999999909 | 6.524 |  |  |
| 5.324999999999909 | 6.527 |  |  |
| 5.329999999999909 | 6.53 |  |  |
| 5.334999999999908 | 6.533 |  |  |
| 5.339999999999908 | 6.536 |  |  |
| 5.344999999999908 | 6.539 |  |  |
| 5.349999999999908 | 6.542 |  |  |
| 5.354999999999908 | 6.545 |  |  |
| 5.359999999999908 | 6.548 |  |  |
| 5.364999999999908 | 6.551 |  |  |
| 5.369999999999908 | 6.554 |  |  |
| 5.374999999999908 | 6.557 |  |  |
| 5.379999999999907 | 6.56 |  |  |
| 5.384999999999907 | 6.564 |  |  |
| 5.389999999999907 | 6.567 |  |  |
| 5.394999999999907 | 6.57 |  |  |
| 5.399999999999907 | 6.573 |  |  |
| 5.404999999999907 | 6.576 |  |  |
| 5.409999999999906 | 6.579 |  |  |
| 5.414999999999907 | 6.582 |  |  |
| 5.419999999999906 | 6.585 |  |  |
| 5.424999999999907 | 6.588 |  |  |
| 5.429999999999906 | 6.591 |  |  |
| 5.434999999999906 | 6.594 |  |  |
| 5.439999999999906 | 6.597 |  |  |
| 5.444999999999906 | 6.6 |  |  |
| 5.449999999999905 | 6.603 |  |  |
| 5.454999999999906 | 6.606 |  |  |
| 5.459999999999905 | 6.609 |  |  |
| 5.464999999999906 | 6.612 |  |  |
| 5.469999999999905 | 6.615 |  |  |
| 5.474999999999905 | 6.618 |  |  |
| 5.479999999999905 | 6.621 |  |  |
| 5.484999999999905 | 6.624 |  |  |
| 5.489999999999905 | 6.627 |  |  |
| 5.494999999999905 | 6.63 |  |  |
| 5.499999999999904 | 6.633 |  |  |
| 5.504999999999905 | 6.636 |  |  |
| 5.509999999999904 | 6.639 |  |  |
| 5.514999999999905 | 6.642 |  |  |
| 5.519999999999904 | 6.645 |  |  |
| 5.524999999999904 | 6.648 |  |  |
| 5.529999999999904 | 6.651 |  |  |
| 5.534999999999904 | 6.654 |  |  |
| 5.539999999999904 | 6.657 |  |  |
| 5.544999999999904 | 6.66 |  |  |
| 5.549999999999904 | 6.663 |  |  |
| 5.554999999999904 | 6.666 |  |  |
| 5.559999999999904 | 6.669 |  |  |
| 5.564999999999904 | 6.672 |  |  |
| 5.569999999999903 | 6.675 |  |  |
| 5.574999999999903 | 6.678 |  |  |
| 5.579999999999903 | 6.681 |  |  |
| 5.584999999999903 | 6.684 |  |  |
| 5.589999999999903 | 6.687 |  |  |
| 5.594999999999903 | 6.69 |  |  |
| 5.599999999999903 | 6.693 |  |  |
| 5.604999999999903 | 6.696 |  |  |
| 5.609999999999903 | 6.699 |  |  |
| 5.614999999999902 | 6.702 |  |  |
| 5.619999999999902 | 6.705 |  |  |
| 5.624999999999902 | 6.708 |  |  |
| 5.629999999999902 | 6.711 |  |  |
| 5.634999999999902 | 6.714 |  |  |
| 5.639999999999902 | 6.717 |  |  |
| 5.644999999999902 | 6.72 |  |  |
| 5.649999999999902 | 6.723 |  |  |
| 5.654999999999902 | 6.726 |  |  |
| 5.659999999999901 | 6.729 |  |  |
| 5.664999999999901 | 6.732 |  |  |
| 5.669999999999901 | 6.735 |  |  |
| 5.674999999999901 | 6.738 |  |  |
| 5.679999999999901 | 6.741 |  |  |
| 5.684999999999901 | 6.744 |  |  |
| 5.689999999999901 | 6.747 |  |  |
| 5.694999999999901 | 6.75 |  |  |
| 5.699999999999901 | 6.753 |  |  |
| 5.704999999999901 | 6.756 |  |  |
| 5.7099999999999 | 6.759 |  |  |
| 5.7149999999999 | 6.762 |  |  |
| 5.7199999999999 | 6.765 |  |  |
| 5.7249999999999 | 6.768 |  |  |
| 5.7299999999999 | 6.771 |  |  |
| 5.7349999999999 | 6.773 |  |  |
| 5.7399999999999 | 6.776 |  |  |
| 5.7449999999999 | 6.779 |  |  |
| 5.7499999999999 | 6.782 |  |  |
| 5.754999999999899 | 6.785 |  |  |
| 5.7599999999999 | 6.788 |  |  |
| 5.764999999999899 | 6.791 |  |  |
| 5.7699999999999 | 6.794 |  |  |
| 5.7749999999999 | 6.797 |  |  |
| 5.779999999999898 | 6.8 |  |  |
| 5.784999999999899 | 6.803 |  |  |
| 5.789999999999898 | 6.806 |  |  |
| 5.794999999999899 | 6.809 |  |  |
| 5.799999999999898 | 6.812 |  |  |
| 5.804999999999898 | 6.815 |  |  |
| 5.809999999999898 | 6.818 |  |  |
| 5.814999999999898 | 6.821 |  |  |
| 5.819999999999898 | 6.823 |  |  |
| 5.824999999999898 | 6.826 |  |  |
| 5.829999999999898 | 6.829 |  |  |
| 5.834999999999898 | 6.832 |  |  |
| 5.839999999999897 | 6.835 |  |  |
| 5.844999999999898 | 6.838 |  |  |
| 5.849999999999897 | 6.841 |  |  |
| 5.854999999999897 | 6.844 |  |  |
| 5.859999999999897 | 6.847 |  |  |
| 5.864999999999897 | 6.85 |  |  |
| 5.869999999999897 | 6.853 |  |  |
| 5.874999999999897 | 6.856 |  |  |
| 5.879999999999896 | 6.859 |  |  |
| 5.884999999999897 | 6.861 |  |  |
| 5.889999999999896 | 6.864 |  |  |
| 5.894999999999896 | 6.867 |  |  |
| 5.899999999999896 | 6.87 |  |  |
| 5.904999999999896 | 6.873 |  |  |
| 5.909999999999896 | 6.876 |  |  |
| 5.914999999999896 | 6.879 |  |  |
| 5.919999999999895 | 6.882 |  |  |
| 5.924999999999896 | 6.885 |  |  |
| 5.929999999999895 | 6.888 |  |  |
| 5.934999999999895 | 6.891 |  |  |
| 5.939999999999895 | 6.893 |  |  |
| 5.944999999999895 | 6.896 |  |  |
| 5.949999999999895 | 6.899 |  |  |
| 5.954999999999895 | 6.902 |  |  |
| 5.959999999999895 | 6.905 |  |  |
| 5.964999999999895 | 6.908 |  |  |
| 5.969999999999894 | 6.911 |  |  |
| 5.974999999999894 | 6.914 |  |  |
| 5.979999999999894 | 6.917 |  |  |
| 5.984999999999894 | 6.92 |  |  |
| 5.989999999999894 | 6.922 |  |  |
| 5.994999999999894 | 6.925 |  |  |
| 5.999999999999894 | 6.928 |  |  |
| 6.004999999999894 | 6.931 |  |  |
| 6.009999999999894 | 6.934 |  |  |
| 6.014999999999894 | 6.937 |  |  |
| 6.019999999999894 | 6.94 |  |  |
| 6.024999999999894 | 6.943 |  |  |
| 6.029999999999894 | 6.946 |  |  |
| 6.034999999999894 | 6.948 |  |  |
| 6.039999999999893 | 6.951 |  |  |
| 6.044999999999893 | 6.954 |  |  |
| 6.049999999999893 | 6.957 |  |  |
| 6.054999999999893 | 6.96 |  |  |
| 6.059999999999893 | 6.963 |  |  |
| 6.064999999999893 | 6.966 |  |  |
| 6.069999999999893 | 6.969 |  |  |
| 6.074999999999893 | 6.971 |  |  |
| 6.079999999999892 | 6.974 |  |  |
| 6.084999999999892 | 6.977 |  |  |
| 6.089999999999892 | 6.98 |  |  |
| 6.094999999999892 | 6.983 |  |  |
| 6.099999999999892 | 6.986 |  |  |
| 6.104999999999892 | 6.989 |  |  |
| 6.109999999999892 | 6.991 |  |  |
| 6.114999999999892 | 6.994 |  |  |
| 6.119999999999892 | 6.997 |  |  |
| 6.124999999999892 | 7 |  |  |
| 6.129999999999892 | 7.003 |  |  |
| 6.134999999999891 | 7.006 |  |  |
| 6.139999999999891 | 7.009 |  |  |
| 6.144999999999891 | 7.011 |  |  |
| 6.149999999999891 | 7.014 |  |  |
| 6.154999999999891 | 7.017 |  |  |
| 6.159999999999891 | 7.02 |  |  |
| 6.164999999999891 | 7.023 |  |  |
| 6.169999999999891 | 7.026 |  |  |
| 6.174999999999891 | 7.029 |  |  |
| 6.17999999999989 | 7.031 |  |  |
| 6.18499999999989 | 7.034 |  |  |
| 6.18999999999989 | 7.037 |  |  |
| 6.19499999999989 | 7.04 |  |  |
| 6.19999999999989 | 7.043 |  |  |
| 6.20499999999989 | 7.046 |  |  |
| 6.20999999999989 | 7.048 |  |  |
| 6.21499999999989 | 7.051 |  |  |
| 6.21999999999989 | 7.054 |  |  |
| 6.224999999999889 | 7.057 |  |  |
| 6.22999999999989 | 7.06 |  |  |
| 6.23499999999989 | 7.063 |  |  |
| 6.23999999999989 | 7.065 |  |  |
| 6.24499999999989 | 7.068 |  |  |
| 6.249999999999888 | 7.071 |  |  |
| 6.254999999999889 | 7.074 |  |  |
| 6.259999999999888 | 7.077 |  |  |
| 6.264999999999889 | 7.08 |  |  |
| 6.269999999999888 | 7.082 |  |  |
| 6.274999999999888 | 7.085 |  |  |
| 6.279999999999888 | 7.088 |  |  |
| 6.284999999999888 | 7.091 |  |  |
| 6.289999999999888 | 7.094 |  |  |
| 6.294999999999888 | 7.096 |  |  |
| 6.299999999999887 | 7.099 |  |  |
| 6.304999999999888 | 7.102 |  |  |
| 6.309999999999887 | 7.105 |  |  |
| 6.314999999999888 | 7.108 |  |  |
| 6.319999999999887 | 7.111 |  |  |
| 6.324999999999887 | 7.113 |  |  |
| 6.329999999999887 | 7.116 |  |  |
| 6.334999999999887 | 7.119 |  |  |
| 6.339999999999887 | 7.122 |  |  |
| 6.344999999999887 | 7.125 |  |  |
| 6.349999999999886 | 7.127 |  |  |
| 6.354999999999887 | 7.13 |  |  |
| 6.359999999999886 | 7.133 |  |  |
| 6.364999999999886 | 7.136 |  |  |
| 6.369999999999886 | 7.139 |  |  |
| 6.374999999999886 | 7.141 |  |  |
| 6.379999999999886 | 7.144 |  |  |
| 6.384999999999886 | 7.147 |  |  |
| 6.389999999999885 | 7.15 |  |  |
| 6.394999999999886 | 7.153 |  |  |
| 6.399999999999885 | 7.155 |  |  |
| 6.404999999999885 | 7.158 |  |  |
| 6.409999999999885 | 7.161 |  |  |
| 6.414999999999885 | 7.164 |  |  |
| 6.419999999999885 | 7.167 |  |  |
| 6.424999999999885 | 7.169 |  |  |
| 6.429999999999885 | 7.172 |  |  |
| 6.434999999999885 | 7.175 |  |  |
| 6.439999999999884 | 7.178 |  |  |
| 6.444999999999884 | 7.181 |  |  |
| 6.449999999999884 | 7.183 |  |  |
| 6.454999999999884 | 7.186 |  |  |
| 6.459999999999884 | 7.189 |  |  |
| 6.464999999999884 | 7.192 |  |  |
| 6.469999999999884 | 7.194 |  |  |
| 6.474999999999884 | 7.197 |  |  |
| 6.479999999999884 | 7.2 |  |  |
| 6.484999999999884 | 7.203 |  |  |
| 6.489999999999883 | 7.206 |  |  |
| 6.494999999999884 | 7.208 |  |  |
| 6.499999999999883 | 7.211 |  |  |
| 6.504999999999884 | 7.214 |  |  |
| 6.509999999999883 | 7.217 |  |  |
| 6.514999999999883 | 7.219 |  |  |
| 6.519999999999883 | 7.222 |  |  |
| 6.524999999999883 | 7.225 |  |  |
| 6.529999999999883 | 7.228 |  |  |
| 6.534999999999883 | 7.23 |  |  |
| 6.539999999999882 | 7.233 |  |  |
| 6.544999999999883 | 7.236 |  |  |
| 6.549999999999882 | 7.239 |  |  |
| 6.554999999999882 | 7.242 |  |  |
| 6.559999999999882 | 7.244 |  |  |
| 6.564999999999882 | 7.247 |  |  |
| 6.569999999999882 | 7.25 |  |  |
| 6.574999999999882 | 7.253 |  |  |
| 6.579999999999881 | 7.255 |  |  |
| 6.584999999999882 | 7.258 |  |  |
| 6.589999999999881 | 7.261 |  |  |
| 6.594999999999882 | 7.264 |  |  |
| 6.599999999999881 | 7.266 |  |  |
| 6.604999999999881 | 7.269 |  |  |
| 6.609999999999881 | 7.272 |  |  |
| 6.614999999999881 | 7.275 |  |  |
| 6.619999999999881 | 7.277 |  |  |
| 6.624999999999881 | 7.28 |  |  |
| 6.629999999999881 | 7.283 |  |  |
| 6.634999999999881 | 7.286 |  |  |
| 6.63999999999988 | 7.288 |  |  |
| 6.64499999999988 | 7.291 |  |  |
| 6.64999999999988 | 7.294 |  |  |
| 6.65499999999988 | 7.297 |  |  |
| 6.65999999999988 | 7.299 |  |  |
| 6.66499999999988 | 7.302 |  |  |
| 6.66999999999988 | 7.305 |  |  |
| 6.67499999999988 | 7.308 |  |  |
| 6.67999999999988 | 7.31 |  |  |
| 6.68499999999988 | 7.313 |  |  |
| 6.68999999999988 | 7.316 |  |  |
| 6.694999999999879 | 7.318 |  |  |
| 6.69999999999988 | 7.321 |  |  |
| 6.70499999999988 | 7.324 |  |  |
| 6.70999999999988 | 7.327 |  |  |
| 6.714999999999879 | 7.329 |  |  |
| 6.719999999999878 | 7.332 |  |  |
| 6.724999999999879 | 7.335 |  |  |
| 6.729999999999878 | 7.338 |  |  |
| 6.734999999999878 | 7.34 |  |  |
| 6.739999999999878 | 7.343 |  |  |
| 6.744999999999878 | 7.346 |  |  |
| 6.749999999999878 | 7.348 |  |  |
| 6.754999999999878 | 7.351 |  |  |
| 6.759999999999878 | 7.354 |  |  |
| 6.764999999999878 | 7.357 |  |  |
| 6.769999999999877 | 7.359 |  |  |
| 6.774999999999877 | 7.362 |  |  |
| 6.779999999999877 | 7.365 |  |  |
| 6.784999999999877 | 7.367 |  |  |
| 6.789999999999877 | 7.37 |  |  |
| 6.794999999999877 | 7.373 |  |  |
| 6.799999999999877 | 7.376 |  |  |
| 6.804999999999877 | 7.378 |  |  |
| 6.809999999999876 | 7.381 |  |  |
| 6.814999999999877 | 7.384 |  |  |
| 6.819999999999876 | 7.386 |  |  |
| 6.824999999999877 | 7.389 |  |  |
| 6.829999999999876 | 7.392 |  |  |
| 6.834999999999876 | 7.395 |  |  |
| 6.839999999999876 | 7.397 |  |  |
| 6.844999999999876 | 7.4 |  |  |
| 6.849999999999876 | 7.403 |  |  |
| 6.854999999999876 | 7.405 |  |  |
| 6.859999999999875 | 7.408 |  |  |
| 6.864999999999876 | 7.411 |  |  |
| 6.869999999999875 | 7.414 |  |  |
| 6.874999999999875 | 7.416 |  |  |
| 6.879999999999875 | 7.419 |  |  |
| 6.884999999999875 | 7.422 |  |  |
| 6.889999999999875 | 7.424 |  |  |
| 6.894999999999875 | 7.427 |  |  |
| 6.899999999999875 | 7.43 |  |  |
| 6.904999999999874 | 7.432 |  |  |
| 6.909999999999874 | 7.435 |  |  |
| 6.914999999999874 | 7.438 |  |  |
| 6.919999999999874 | 7.44 |  |  |
| 6.924999999999874 | 7.443 |  |  |
| 6.929999999999874 | 7.446 |  |  |
| 6.934999999999874 | 7.448 |  |  |
| 6.939999999999874 | 7.451 |  |  |
| 6.944999999999874 | 7.454 |  |  |
| 6.949999999999874 | 7.457 |  |  |
| 6.954999999999874 | 7.459 |  |  |
| 6.959999999999873 | 7.462 |  |  |
| 6.964999999999874 | 7.465 |  |  |
| 6.969999999999873 | 7.467 |  |  |
| 6.974999999999873 | 7.47 |  |  |
| 6.979999999999873 | 7.473 |  |  |
| 6.984999999999873 | 7.475 |  |  |
| 6.989999999999873 | 7.478 |  |  |
| 6.994999999999873 | 7.481 |  |  |
| 6.999999999999872 | 7.483 |  |  |
| 7.004999999999873 | 7.486 |  |  |
| 7.009999999999872 | 7.489 |  |  |
| 7.014999999999873 | 7.491 |  |  |
| 7.019999999999872 | 7.494 |  |  |
| 7.024999999999872 | 7.497 |  |  |
| 7.029999999999872 | 7.499 |  |  |
| 7.034999999999872 | 7.502 |  |  |
| 7.039999999999872 | 7.505 |  |  |
| 7.044999999999872 | 7.507 |  |  |
| 7.049999999999871 | 7.51 |  |  |
| 7.054999999999872 | 7.513 |  |  |
| 7.059999999999871 | 7.515 |  |  |
| 7.064999999999872 | 7.518 |  |  |
| 7.069999999999871 | 7.521 |  |  |
| 7.074999999999871 | 7.523 |  |  |
| 7.07999999999987 | 7.526 |  |  |
| 7.084999999999871 | 7.529 |  |  |
| 7.08999999999987 | 7.531 |  |  |
| 7.094999999999871 | 7.534 |  |  |
| 7.09999999999987 | 7.537 |  |  |
| 7.104999999999871 | 7.539 |  |  |
| 7.10999999999987 | 7.542 |  |  |
| 7.114999999999871 | 7.545 |  |  |
| 7.11999999999987 | 7.547 |  |  |
| 7.12499999999987 | 7.55 |  |  |
| 7.12999999999987 | 7.552 |  |  |
| 7.13499999999987 | 7.555 |  |  |
| 7.13999999999987 | 7.558 |  |  |
| 7.14499999999987 | 7.56 |  |  |
| 7.14999999999987 | 7.563 |  |  |
| 7.15499999999987 | 7.566 |  |  |
| 7.15999999999987 | 7.568 |  |  |
| 7.164999999999869 | 7.571 |  |  |
| 7.16999999999987 | 7.574 |  |  |
| 7.17499999999987 | 7.576 |  |  |
| 7.17999999999987 | 7.579 |  |  |
| 7.18499999999987 | 7.582 |  |  |
| 7.189999999999868 | 7.584 |  |  |
| 7.194999999999869 | 7.587 |  |  |
| 7.199999999999868 | 7.589 |  |  |
| 7.204999999999868 | 7.592 |  |  |
| 7.209999999999868 | 7.595 |  |  |
| 7.214999999999868 | 7.597 |  |  |
| 7.219999999999868 | 7.6 |  |  |
| 7.224999999999868 | 7.603 |  |  |
| 7.229999999999868 | 7.605 |  |  |
| 7.234999999999867 | 7.608 |  |  |
| 7.239999999999867 | 7.611 |  |  |
| 7.244999999999867 | 7.613 |  |  |
| 7.249999999999867 | 7.616 |  |  |
| 7.254999999999867 | 7.618 |  |  |
| 7.259999999999867 | 7.621 |  |  |
| 7.264999999999867 | 7.624 |  |  |
| 7.269999999999867 | 7.626 |  |  |
| 7.274999999999867 | 7.629 |  |  |
| 7.279999999999867 | 7.632 |  |  |
| 7.284999999999866 | 7.634 |  |  |
| 7.289999999999866 | 7.637 |  |  |
| 7.294999999999866 | 7.639 |  |  |
| 7.299999999999866 | 7.642 |  |  |
| 7.304999999999866 | 7.645 |  |  |
| 7.309999999999866 | 7.647 |  |  |
| 7.314999999999866 | 7.65 |  |  |
| 7.319999999999866 | 7.652 |  |  |
| 7.324999999999866 | 7.655 |  |  |
| 7.329999999999865 | 7.658 |  |  |
| 7.334999999999865 | 7.66 |  |  |
| 7.339999999999865 | 7.663 |  |  |
| 7.344999999999865 | 7.666 |  |  |
| 7.349999999999865 | 7.668 |  |  |
| 7.354999999999865 | 7.671 |  |  |
| 7.359999999999865 | 7.673 |  |  |
| 7.364999999999865 | 7.676 |  |  |
| 7.369999999999865 | 7.679 |  |  |
| 7.374999999999864 | 7.681 |  |  |
| 7.379999999999864 | 7.684 |  |  |
| 7.384999999999864 | 7.686 |  |  |
| 7.389999999999864 | 7.689 |  |  |
| 7.394999999999864 | 7.692 |  |  |
| 7.399999999999864 | 7.694 |  |  |
| 7.404999999999864 | 7.697 |  |  |
| 7.409999999999864 | 7.699 |  |  |
| 7.414999999999864 | 7.702 |  |  |
| 7.419999999999864 | 7.705 |  |  |
| 7.424999999999864 | 7.707 |  |  |
| 7.429999999999863 | 7.71 |  |  |
| 7.434999999999863 | 7.712 |  |  |
| 7.439999999999863 | 7.715 |  |  |
| 7.444999999999863 | 7.718 |  |  |
| 7.449999999999863 | 7.72 |  |  |
| 7.454999999999863 | 7.723 |  |  |
| 7.459999999999863 | 7.725 |  |  |
| 7.464999999999863 | 7.728 |  |  |
| 7.469999999999862 | 7.73 |  |  |
| 7.474999999999862 | 7.733 |  |  |
| 7.479999999999862 | 7.736 |  |  |
| 7.484999999999862 | 7.738 |  |  |
| 7.489999999999862 | 7.741 |  |  |
| 7.494999999999862 | 7.743 |  |  |
| 7.499999999999862 | 7.746 |  |  |
| 7.504999999999862 | 7.749 |  |  |
| 7.509999999999862 | 7.751 |  |  |
| 7.514999999999862 | 7.754 |  |  |
| 7.519999999999861 | 7.756 |  |  |
| 7.524999999999862 | 7.759 |  |  |
| 7.529999999999861 | 7.761 |  |  |
| 7.534999999999861 | 7.764 |  |  |
| 7.53999999999986 | 7.767 |  |  |
| 7.544999999999861 | 7.769 |  |  |
| 7.54999999999986 | 7.772 |  |  |
| 7.554999999999861 | 7.774 |  |  |
| 7.55999999999986 | 7.777 |  |  |
| 7.564999999999861 | 7.779 |  |  |
| 7.56999999999986 | 7.782 |  |  |
| 7.57499999999986 | 7.785 |  |  |
| 7.57999999999986 | 7.787 |  |  |
| 7.58499999999986 | 7.79 |  |  |
| 7.58999999999986 | 7.792 |  |  |
| 7.59499999999986 | 7.795 |  |  |
| 7.59999999999986 | 7.797 |  |  |
| 7.60499999999986 | 7.8 |  |  |
| 7.60999999999986 | 7.803 |  |  |
| 7.61499999999986 | 7.805 |  |  |
| 7.61999999999986 | 7.808 |  |  |
| 7.62499999999986 | 7.81 |  |  |
| 7.629999999999859 | 7.813 |  |  |
| 7.634999999999859 | 7.815 |  |  |
| 7.63999999999986 | 7.818 |  |  |
| 7.644999999999859 | 7.82 |  |  |
| 7.64999999999986 | 7.823 |  |  |
| 7.654999999999859 | 7.826 |  |  |
| 7.659999999999859 | 7.828 |  |  |
| 7.664999999999859 | 7.831 |  |  |
| 7.669999999999859 | 7.833 |  |  |
| 7.674999999999859 | 7.836 |  |  |
| 7.679999999999858 | 7.838 |  |  |
| 7.684999999999858 | 7.841 |  |  |
| 7.689999999999858 | 7.843 |  |  |
| 7.694999999999858 | 7.846 |  |  |
| 7.699999999999858 | 7.849 |  |  |
| 7.704999999999858 | 7.851 |  |  |
| 7.709999999999857 | 7.854 |  |  |
| 7.714999999999858 | 7.856 |  |  |
| 7.719999999999857 | 7.859 |  |  |
| 7.724999999999857 | 7.861 |  |  |
| 7.729999999999857 | 7.864 |  |  |
| 7.734999999999857 | 7.866 |  |  |
| 7.739999999999857 | 7.869 |  |  |
| 7.744999999999857 | 7.871 |  |  |
| 7.749999999999856 | 7.874 |  |  |
| 7.754999999999857 | 7.877 |  |  |
| 7.759999999999856 | 7.879 |  |  |
| 7.764999999999857 | 7.882 |  |  |
| 7.769999999999856 | 7.884 |  |  |
| 7.774999999999856 | 7.887 |  |  |
| 7.779999999999856 | 7.889 |  |  |
| 7.784999999999856 | 7.892 |  |  |
| 7.789999999999856 | 7.894 |  |  |
| 7.794999999999856 | 7.897 |  |  |
| 7.799999999999855 | 7.899 |  |  |
| 7.804999999999856 | 7.902 |  |  |
| 7.809999999999855 | 7.904 |  |  |
| 7.814999999999856 | 7.907 |  |  |
| 7.819999999999855 | 7.909 |  |  |
| 7.824999999999855 | 7.912 |  |  |
| 7.829999999999855 | 7.915 |  |  |
| 7.834999999999855 | 7.917 |  |  |
| 7.839999999999855 | 7.92 |  |  |
| 7.844999999999855 | 7.922 |  |  |
| 7.849999999999854 | 7.925 |  |  |
| 7.854999999999855 | 7.927 |  |  |
| 7.859999999999854 | 7.93 |  |  |
| 7.864999999999854 | 7.932 |  |  |
| 7.869999999999854 | 7.935 |  |  |
| 7.874999999999854 | 7.937 |  |  |
| 7.879999999999854 | 7.94 |  |  |
| 7.884999999999854 | 7.942 |  |  |
| 7.889999999999854 | 7.945 |  |  |
| 7.894999999999854 | 7.947 |  |  |
| 7.899999999999854 | 7.95 |  |  |
| 7.904999999999854 | 7.952 |  |  |
| 7.909999999999853 | 7.955 |  |  |
| 7.914999999999853 | 7.957 |  |  |
| 7.919999999999853 | 7.96 |  |  |
| 7.924999999999853 | 7.962 |  |  |
| 7.929999999999853 | 7.965 |  |  |
| 7.934999999999853 | 7.967 |  |  |
| 7.939999999999852 | 7.97 |  |  |
| 7.944999999999853 | 7.972 |  |  |
| 7.949999999999852 | 7.975 |  |  |
| 7.954999999999853 | 7.977 |  |  |
| 7.959999999999852 | 7.98 |  |  |
| 7.964999999999852 | 7.982 |  |  |
| 7.969999999999852 | 7.985 |  |  |
| 7.974999999999852 | 7.987 |  |  |
| 7.979999999999852 | 7.99 |  |  |
| 7.984999999999852 | 7.992 |  |  |
| 7.989999999999851 | 7.995 |  |  |
| 7.994999999999852 | 7.997 |  |  |
| 7.999999999999851 | 8 |  |  |
| 8.004999999999852 | 8.002 |  |  |
| 8.009999999999852 | 8.005 |  |  |
| 8.014999999999853 | 8.007 |  |  |
| 8.019999999999852 | 8.01 |  |  |
| 8.024999999999855 | 8.012 |  |  |
| 8.029999999999855 | 8.015 |  |  |
| 8.034999999999856 | 8.017 |  |  |
| 8.039999999999857 | 8.02 |  |  |
| 8.044999999999858 | 8.022 |  |  |
| 8.049999999999859 | 8.025 |  |  |
| 8.05499999999986 | 8.027 |  |  |
| 8.05999999999986 | 8.03 |  |  |
| 8.06499999999986 | 8.032 |  |  |
| 8.06999999999986 | 8.035 |  |  |
| 8.074999999999863 | 8.037 |  |  |
| 8.079999999999863 | 8.04 |  |  |
| 8.084999999999864 | 8.042 |  |  |
| 8.089999999999865 | 8.045 |  |  |
| 8.094999999999866 | 8.047 |  |  |
| 8.099999999999866 | 8.05 |  |  |
| 8.104999999999867 | 8.052 |  |  |
| 8.109999999999866 | 8.055 |  |  |
| 8.114999999999869 | 8.057 |  |  |
| 8.11999999999987 | 8.06 |  |  |
| 8.12499999999987 | 8.062 |  |  |
| 8.129999999999871 | 8.065 |  |  |
| 8.134999999999872 | 8.067 |  |  |
| 8.139999999999873 | 8.07 |  |  |
| 8.144999999999873 | 8.072 |  |  |
| 8.149999999999874 | 8.075 |  |  |
| 8.154999999999875 | 8.077 |  |  |
| 8.159999999999876 | 8.08 |  |  |
| 8.164999999999877 | 8.082 |  |  |
| 8.169999999999877 | 8.085 |  |  |
| 8.174999999999878 | 8.087 |  |  |
| 8.179999999999877 | 8.089 |  |  |
| 8.18499999999988 | 8.092 |  |  |
| 8.18999999999988 | 8.094 |  |  |
| 8.194999999999881 | 8.097 |  |  |
| 8.199999999999882 | 8.099 |  |  |
| 8.204999999999883 | 8.102 |  |  |
| 8.209999999999884 | 8.104 |  |  |
| 8.214999999999884 | 8.107 |  |  |
| 8.219999999999885 | 8.109 |  |  |
| 8.224999999999886 | 8.112 |  |  |
| 8.229999999999887 | 8.114 |  |  |
| 8.234999999999888 | 8.117 |  |  |
| 8.239999999999888 | 8.119 |  |  |
| 8.244999999999889 | 8.122 |  |  |
| 8.24999999999989 | 8.124 |  |  |
| 8.25499999999989 | 8.126 |  |  |
| 8.25999999999989 | 8.129 |  |  |
| 8.264999999999892 | 8.131 |  |  |
| 8.269999999999891 | 8.134 |  |  |
| 8.274999999999894 | 8.136 |  |  |
| 8.279999999999895 | 8.139 |  |  |
| 8.284999999999895 | 8.141 |  |  |
| 8.289999999999896 | 8.144 |  |  |
| 8.294999999999897 | 8.146 |  |  |
| 8.299999999999898 | 8.149 |  |  |
| 8.304999999999898 | 8.151 |  |  |
| 8.3099999999999 | 8.154 |  |  |
| 8.3149999999999 | 8.156 |  |  |
| 8.3199999999999 | 8.158 |  |  |
| 8.3249999999999 | 8.161 |  |  |
| 8.3299999999999 | 8.163 |  |  |
| 8.334999999999903 | 8.166 |  |  |
| 8.339999999999902 | 8.168 |  |  |
| 8.344999999999905 | 8.171 |  |  |
| 8.349999999999905 | 8.173 |  |  |
| 8.354999999999906 | 8.176 |  |  |
| 8.359999999999907 | 8.178 |  |  |
| 8.364999999999908 | 8.18 |  |  |
| 8.369999999999909 | 8.183 |  |  |
| 8.37499999999991 | 8.185 |  |  |
| 8.37999999999991 | 8.188 |  |  |
| 8.38499999999991 | 8.19 |  |  |
| 8.38999999999991 | 8.193 |  |  |
| 8.39499999999991 | 8.195 |  |  |
| 8.39999999999991 | 8.198 |  |  |
| 8.404999999999914 | 8.2 |  |  |
| 8.409999999999915 | 8.202 |  |  |
| 8.414999999999916 | 8.205 |  |  |
| 8.419999999999916 | 8.207 |  |  |
| 8.424999999999917 | 8.21 |  |  |
| 8.429999999999916 | 8.212 |  |  |
| 8.434999999999919 | 8.215 |  |  |
| 8.43999999999992 | 8.217 |  |  |
| 8.44499999999992 | 8.219 |  |  |
| 8.44999999999992 | 8.222 |  |  |
| 8.45499999999992 | 8.224 |  |  |
| 8.45999999999992 | 8.227 |  |  |
| 8.464999999999923 | 8.229 |  |  |
| 8.469999999999924 | 8.232 |  |  |
| 8.474999999999925 | 8.234 |  |  |
| 8.479999999999926 | 8.237 |  |  |
| 8.484999999999927 | 8.239 |  |  |
| 8.489999999999927 | 8.241 |  |  |
| 8.494999999999928 | 8.244 |  |  |
| 8.499999999999927 | 8.246 |  |  |
| 8.50499999999993 | 8.249 |  |  |
| 8.50999999999993 | 8.251 |  |  |
| 8.51499999999993 | 8.253 |  |  |
| 8.51999999999993 | 8.256 |  |  |
| 8.524999999999933 | 8.258 |  |  |
| 8.529999999999934 | 8.261 |  |  |
| 8.534999999999934 | 8.263 |  |  |
| 8.539999999999935 | 8.266 |  |  |
| 8.544999999999934 | 8.268 |  |  |
| 8.549999999999937 | 8.27 |  |  |
| 8.554999999999938 | 8.273 |  |  |
| 8.559999999999938 | 8.275 |  |  |
| 8.56499999999994 | 8.278 |  |  |
| 8.56999999999994 | 8.28 |  |  |
| 8.57499999999994 | 8.283 |  |  |
| 8.57999999999994 | 8.285 |  |  |
| 8.58499999999994 | 8.287 |  |  |
| 8.58999999999994 | 8.29 |  |  |
| 8.594999999999944 | 8.292 |  |  |
| 8.599999999999945 | 8.295 |  |  |
| 8.604999999999945 | 8.297 |  |  |
| 8.609999999999946 | 8.299 |  |  |
| 8.614999999999945 | 8.302 |  |  |
| 8.619999999999948 | 8.304 |  |  |
| 8.624999999999948 | 8.307 |  |  |
| 8.62999999999995 | 8.309 |  |  |
| 8.63499999999995 | 8.311 |  |  |
| 8.63999999999995 | 8.314 |  |  |
| 8.644999999999952 | 8.316 |  |  |
| 8.649999999999952 | 8.319 |  |  |
| 8.654999999999953 | 8.321 |  |  |
| 8.659999999999952 | 8.323 |  |  |
| 8.664999999999955 | 8.326 |  |  |
| 8.669999999999956 | 8.328 |  |  |
| 8.674999999999956 | 8.331 |  |  |
| 8.679999999999955 | 8.333 |  |  |
| 8.684999999999958 | 8.335 |  |  |
| 8.689999999999959 | 8.338 |  |  |
| 8.69499999999996 | 8.34 |  |  |
| 8.69999999999996 | 8.343 |  |  |
| 8.70499999999996 | 8.345 |  |  |
| 8.70999999999996 | 8.347 |  |  |
| 8.714999999999963 | 8.35 |  |  |
| 8.719999999999963 | 8.352 |  |  |
| 8.724999999999964 | 8.355 |  |  |
| 8.729999999999963 | 8.357 |  |  |
| 8.734999999999966 | 8.359 |  |  |
| 8.739999999999966 | 8.362 |  |  |
| 8.744999999999967 | 8.364 |  |  |
| 8.749999999999966 | 8.367 |  |  |
| 8.754999999999969 | 8.369 |  |  |
| 8.75999999999997 | 8.371 |  |  |
| 8.76499999999997 | 8.374 |  |  |
| 8.76999999999997 | 8.376 |  |  |
| 8.77499999999997 | 8.379 |  |  |
| 8.779999999999973 | 8.381 |  |  |
| 8.784999999999973 | 8.383 |  |  |
| 8.789999999999974 | 8.386 |  |  |
| 8.794999999999975 | 8.388 |  |  |
| 8.799999999999976 | 8.39 |  |  |
| 8.804999999999977 | 8.393 |  |  |
| 8.809999999999977 | 8.395 |  |  |
| 8.814999999999978 | 8.398 |  |  |
| 8.819999999999977 | 8.4 |  |  |
| 8.82499999999998 | 8.402 |  |  |
| 8.82999999999998 | 8.405 |  |  |
| 8.83499999999998 | 8.407 |  |  |
| 8.83999999999998 | 8.41 |  |  |
| 8.844999999999983 | 8.412 |  |  |
| 8.849999999999984 | 8.414 |  |  |
| 8.854999999999984 | 8.417 |  |  |
| 8.859999999999985 | 8.419 |  |  |
| 8.864999999999984 | 8.421 |  |  |
| 8.869999999999987 | 8.424 |  |  |
| 8.874999999999988 | 8.426 |  |  |
| 8.879999999999988 | 8.429 |  |  |
| 8.88499999999999 | 8.431 |  |  |
| 8.88999999999999 | 8.433 |  |  |
| 8.89499999999999 | 8.436 |  |  |
| 8.89999999999999 | 8.438 |  |  |
| 8.90499999999999 | 8.44 |  |  |
| 8.90999999999999 | 8.443 |  |  |
| 8.914999999999994 | 8.445 |  |  |
| 8.919999999999995 | 8.447 |  |  |
| 8.924999999999995 | 8.45 |  |  |
| 8.929999999999996 | 8.452 |  |  |
| 8.934999999999995 | 8.455 |  |  |
| 8.939999999999998 | 8.457 |  |  |
| 8.944999999999999 | 8.459 |  |  |
| 8.95 | 8.462 |  |  |
| 8.955 | 8.464 |  |  |
| 8.96 | 8.466 |  |  |
| 8.965 | 8.469 |  |  |
| 8.970000000000002 | 8.471 |  |  |
| 8.975000000000003 | 8.473 |  |  |
| 8.980000000000002 | 8.476 |  |  |
| 8.985000000000005 | 8.478 |  |  |
| 8.990000000000006 | 8.481 |  |  |
| 8.995000000000006 | 8.483 |  |  |
| 9.000000000000007 | 8.485 |  |  |
| 9.005000000000008 | 8.488 |  |  |
| 9.010000000000009 | 8.49 |  |  |
| 9.01500000000001 | 8.492 |  |  |
| 9.02000000000001 | 8.495 |  |  |
| 9.02500000000001 | 8.497 |  |  |
| 9.030000000000012 | 8.499 |  |  |
| 9.035000000000013 | 8.502 |  |  |
| 9.040000000000013 | 8.504 |  |  |
| 9.045000000000014 | 8.506 |  |  |
| 9.050000000000013 | 8.509 |  |  |
| 9.055000000000016 | 8.511 |  |  |
| 9.060000000000016 | 8.514 |  |  |
| 9.065000000000017 | 8.516 |  |  |
| 9.070000000000018 | 8.518 |  |  |
| 9.075000000000019 | 8.521 |  |  |
| 9.08000000000002 | 8.523 |  |  |
| 9.08500000000002 | 8.525 |  |  |
| 9.090000000000021 | 8.528 |  |  |
| 9.09500000000002 | 8.53 |  |  |
| 9.100000000000023 | 8.532 |  |  |
| 9.105000000000024 | 8.535 |  |  |
| 9.110000000000024 | 8.537 |  |  |
| 9.115000000000025 | 8.539 |  |  |
| 9.120000000000026 | 8.542 |  |  |
| 9.125000000000027 | 8.544 |  |  |
| 9.130000000000027 | 8.546 |  |  |
| 9.135000000000028 | 8.549 |  |  |
| 9.140000000000029 | 8.551 |  |  |
| 9.14500000000003 | 8.553 |  |  |
| 9.15000000000003 | 8.556 |  |  |
| 9.15500000000003 | 8.558 |  |  |
| 9.160000000000032 | 8.56 |  |  |
| 9.165000000000031 | 8.563 |  |  |
| 9.170000000000034 | 8.565 |  |  |
| 9.175000000000034 | 8.567 |  |  |
| 9.180000000000035 | 8.57 |  |  |
| 9.185000000000036 | 8.572 |  |  |
| 9.190000000000037 | 8.574 |  |  |
| 9.195000000000038 | 8.577 |  |  |
| 9.200000000000038 | 8.579 |  |  |
| 9.20500000000004 | 8.581 |  |  |
| 9.21000000000004 | 8.584 |  |  |
| 9.21500000000004 | 8.586 |  |  |
| 9.220000000000041 | 8.588 |  |  |
| 9.225000000000042 | 8.591 |  |  |
| 9.230000000000043 | 8.593 |  |  |
| 9.235000000000044 | 8.595 |  |  |
| 9.240000000000045 | 8.598 |  |  |
| 9.245000000000045 | 8.6 |  |  |
| 9.250000000000046 | 8.602 |  |  |
| 9.255000000000045 | 8.605 |  |  |
| 9.260000000000048 | 8.607 |  |  |
| 9.265000000000049 | 8.609 |  |  |
| 9.27000000000005 | 8.612 |  |  |
| 9.27500000000005 | 8.614 |  |  |
| 9.28000000000005 | 8.616 |  |  |
| 9.285000000000052 | 8.619 |  |  |
| 9.290000000000052 | 8.621 |  |  |
| 9.295000000000053 | 8.623 |  |  |
| 9.300000000000052 | 8.626 |  |  |
| 9.305000000000055 | 8.628 |  |  |
| 9.310000000000056 | 8.63 |  |  |
| 9.315000000000056 | 8.632 |  |  |
| 9.320000000000057 | 8.635 |  |  |
| 9.325000000000056 | 8.637 |  |  |
| 9.330000000000059 | 8.639 |  |  |
| 9.33500000000006 | 8.642 |  |  |
| 9.34000000000006 | 8.644 |  |  |
| 9.34500000000006 | 8.646 |  |  |
| 9.35000000000006 | 8.649 |  |  |
| 9.35500000000006 | 8.651 |  |  |
| 9.360000000000063 | 8.653 |  |  |
| 9.365000000000064 | 8.656 |  |  |
| 9.370000000000063 | 8.658 |  |  |
| 9.375000000000066 | 8.66 |  |  |
| 9.380000000000067 | 8.663 |  |  |
| 9.385000000000067 | 8.665 |  |  |
| 9.390000000000068 | 8.667 |  |  |
| 9.395000000000069 | 8.669 |  |  |
| 9.40000000000007 | 8.672 |  |  |
| 9.40500000000007 | 8.674 |  |  |
| 9.410000000000071 | 8.676 |  |  |
| 9.41500000000007 | 8.679 |  |  |
| 9.420000000000073 | 8.681 |  |  |
| 9.425000000000074 | 8.683 |  |  |
| 9.430000000000074 | 8.686 |  |  |
| 9.435000000000075 | 8.688 |  |  |
| 9.440000000000076 | 8.69 |  |  |
| 9.445000000000077 | 8.693 |  |  |
| 9.450000000000077 | 8.695 |  |  |
| 9.455000000000078 | 8.697 |  |  |
| 9.460000000000077 | 8.699 |  |  |
| 9.46500000000008 | 8.702 |  |  |
| 9.47000000000008 | 8.704 |  |  |
| 9.47500000000008 | 8.706 |  |  |
| 9.480000000000082 | 8.709 |  |  |
| 9.485000000000081 | 8.711 |  |  |
| 9.490000000000084 | 8.713 |  |  |
| 9.495000000000084 | 8.716 |  |  |
| 9.500000000000085 | 8.718 |  |  |
| 9.505000000000086 | 8.72 |  |  |
| 9.510000000000087 | 8.722 |  |  |
| 9.515000000000088 | 8.725 |  |  |
| 9.520000000000088 | 8.727 |  |  |
| 9.52500000000009 | 8.729 |  |  |
| 9.53000000000009 | 8.732 |  |  |
| 9.53500000000009 | 8.734 |  |  |
| 9.540000000000092 | 8.736 |  |  |
| 9.545000000000092 | 8.738 |  |  |
| 9.550000000000093 | 8.741 |  |  |
| 9.555000000000094 | 8.743 |  |  |
| 9.560000000000095 | 8.745 |  |  |
| 9.565000000000095 | 8.748 |  |  |
| 9.570000000000096 | 8.75 |  |  |
| 9.575000000000095 | 8.752 |  |  |
| 9.580000000000098 | 8.754 |  |  |
| 9.585000000000099 | 8.757 |  |  |
| 9.5900000000001 | 8.759 |  |  |
| 9.5950000000001 | 8.761 |  |  |
| 9.600000000000101 | 8.764 |  |  |
| 9.605000000000102 | 8.766 |  |  |
| 9.610000000000102 | 8.768 |  |  |
| 9.615000000000103 | 8.77 |  |  |
| 9.620000000000104 | 8.773 |  |  |
| 9.625000000000105 | 8.775 |  |  |
| 9.630000000000106 | 8.777 |  |  |
| 9.635000000000106 | 8.78 |  |  |
| 9.640000000000107 | 8.782 |  |  |
| 9.645000000000108 | 8.784 |  |  |
| 9.650000000000109 | 8.786 |  |  |
| 9.65500000000011 | 8.789 |  |  |
| 9.66000000000011 | 8.791 |  |  |
| 9.66500000000011 | 8.793 |  |  |
| 9.670000000000112 | 8.795 |  |  |
| 9.675000000000113 | 8.798 |  |  |
| 9.680000000000113 | 8.8 |  |  |
| 9.685000000000114 | 8.802 |  |  |
| 9.690000000000115 | 8.805 |  |  |
| 9.695000000000116 | 8.807 |  |  |
| 9.700000000000117 | 8.809 |  |  |
| 9.705000000000117 | 8.811 |  |  |
| 9.710000000000118 | 8.814 |  |  |
| 9.715000000000119 | 8.816 |  |  |
| 9.72000000000012 | 8.818 |  |  |
| 9.72500000000012 | 8.82 |  |  |
| 9.730000000000121 | 8.823 |  |  |
| 9.735000000000122 | 8.825 |  |  |
| 9.740000000000123 | 8.827 |  |  |
| 9.745000000000124 | 8.829 |  |  |
| 9.750000000000124 | 8.832 |  |  |
| 9.755000000000125 | 8.834 |  |  |
| 9.760000000000126 | 8.836 |  |  |
| 9.765000000000127 | 8.839 |  |  |
| 9.770000000000127 | 8.841 |  |  |
| 9.775000000000128 | 8.843 |  |  |
| 9.780000000000129 | 8.845 |  |  |
| 9.78500000000013 | 8.848 |  |  |
| 9.79000000000013 | 8.85 |  |  |
| 9.795000000000131 | 8.852 |  |  |
| 9.800000000000132 | 8.854 |  |  |
| 9.805000000000131 | 8.857 |  |  |
| 9.810000000000134 | 8.859 |  |  |
| 9.815000000000135 | 8.861 |  |  |
| 9.820000000000135 | 8.863 |  |  |
| 9.825000000000136 | 8.866 |  |  |
| 9.830000000000137 | 8.868 |  |  |
| 9.835000000000138 | 8.87 |  |  |
| 9.840000000000138 | 8.872 |  |  |
| 9.84500000000014 | 8.875 |  |  |
| 9.85000000000014 | 8.877 |  |  |
| 9.85500000000014 | 8.879 |  |  |
| 9.86000000000014 | 8.881 |  |  |
| 9.86500000000014 | 8.884 |  |  |
| 9.870000000000143 | 8.886 |  |  |
| 9.875000000000144 | 8.888 |  |  |
| 9.880000000000145 | 8.89 |  |  |
| 9.885000000000145 | 8.893 |  |  |
| 9.890000000000146 | 8.895 |  |  |
| 9.895000000000145 | 8.897 |  |  |
| 9.900000000000148 | 8.899 |  |  |
| 9.905000000000149 | 8.902 |  |  |
| 9.91000000000015 | 8.904 |  |  |
| 9.91500000000015 | 8.906 |  |  |
| 9.920000000000151 | 8.908 |  |  |
| 9.925000000000152 | 8.911 |  |  |
| 9.930000000000152 | 8.913 |  |  |
| 9.935000000000153 | 8.915 |  |  |
| 9.940000000000154 | 8.917 |  |  |
| 9.945000000000155 | 8.92 |  |  |
| 9.950000000000156 | 8.922 |  |  |
| 9.955000000000156 | 8.924 |  |  |
| 9.960000000000157 | 8.926 |  |  |
| 9.965000000000156 | 8.929 |  |  |
| 9.970000000000159 | 8.931 |  |  |
| 9.97500000000016 | 8.933 |  |  |
| 9.98000000000016 | 8.935 |  |  |
| 9.98500000000016 | 8.938 |  |  |
| 9.990000000000162 | 8.94 |  |  |
| 9.995000000000163 | 8.942 |  |  |
| 10.00000000000016 | 8.944 |  |  |